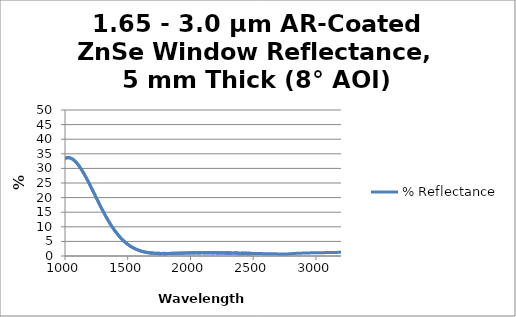
| Category | % Reflectance |
|---|---|
| 200.0 | 3.666 |
| 201.0 | 5.082 |
| 202.0 | 7.073 |
| 203.0 | 9.53 |
| 204.0 | 12.258 |
| 205.0 | 15.007 |
| 206.0 | 17.717 |
| 207.0 | 20.237 |
| 208.0 | 22.5 |
| 209.0 | 24.426 |
| 210.0 | 25.97 |
| 211.0 | 27.179 |
| 212.0 | 28.001 |
| 213.0 | 28.426 |
| 214.0 | 28.436 |
| 215.0 | 28.164 |
| 216.0 | 27.626 |
| 217.0 | 26.695 |
| 218.0 | 25.353 |
| 219.0 | 23.731 |
| 220.0 | 21.91 |
| 221.0 | 19.888 |
| 222.0 | 17.68 |
| 223.0 | 15.425 |
| 224.0 | 13.133 |
| 225.0 | 10.946 |
| 226.0 | 8.916 |
| 227.0 | 7.064 |
| 228.0 | 5.542 |
| 229.0 | 4.414 |
| 230.0 | 3.74 |
| 231.0 | 3.552 |
| 232.0 | 3.887 |
| 233.0 | 4.678 |
| 234.0 | 5.891 |
| 235.0 | 7.478 |
| 236.0 | 9.379 |
| 237.0 | 11.511 |
| 238.0 | 13.826 |
| 239.0 | 16.229 |
| 240.0 | 18.621 |
| 241.0 | 20.924 |
| 242.0 | 23.081 |
| 243.0 | 25.056 |
| 244.0 | 26.84 |
| 245.0 | 28.445 |
| 246.0 | 29.845 |
| 247.0 | 31.042 |
| 248.0 | 32.017 |
| 249.0 | 32.776 |
| 250.0 | 33.296 |
| 251.0 | 33.551 |
| 252.0 | 33.575 |
| 253.0 | 33.398 |
| 254.0 | 33.012 |
| 255.0 | 32.386 |
| 256.0 | 31.574 |
| 257.0 | 30.581 |
| 258.0 | 29.33 |
| 259.0 | 27.92 |
| 260.0 | 26.351 |
| 261.0 | 24.632 |
| 262.0 | 22.848 |
| 263.0 | 20.999 |
| 264.0 | 19.094 |
| 265.0 | 17.198 |
| 266.0 | 15.297 |
| 267.0 | 13.388 |
| 268.0 | 11.549 |
| 269.0 | 9.837 |
| 270.0 | 8.294 |
| 271.0 | 6.973 |
| 272.0 | 5.88 |
| 273.0 | 4.996 |
| 274.0 | 4.354 |
| 275.0 | 3.959 |
| 276.0 | 3.806 |
| 277.0 | 3.928 |
| 278.0 | 4.288 |
| 279.0 | 4.836 |
| 280.0 | 5.585 |
| 281.0 | 6.544 |
| 282.0 | 7.652 |
| 283.0 | 8.867 |
| 284.0 | 10.141 |
| 285.0 | 11.494 |
| 286.0 | 12.906 |
| 287.0 | 14.3 |
| 288.0 | 15.71 |
| 289.0 | 17.126 |
| 290.0 | 18.454 |
| 291.0 | 19.744 |
| 292.0 | 20.956 |
| 293.0 | 21.994 |
| 294.0 | 22.928 |
| 295.0 | 23.801 |
| 296.0 | 24.588 |
| 297.0 | 25.205 |
| 298.0 | 25.71 |
| 299.0 | 26.096 |
| 300.0 | 26.326 |
| 301.0 | 26.457 |
| 302.0 | 26.517 |
| 303.0 | 26.393 |
| 304.0 | 26.192 |
| 305.0 | 25.94 |
| 306.0 | 25.543 |
| 307.0 | 25.044 |
| 308.0 | 24.434 |
| 309.0 | 23.781 |
| 310.0 | 23.091 |
| 311.0 | 22.331 |
| 312.0 | 21.509 |
| 313.0 | 20.663 |
| 314.0 | 19.825 |
| 315.0 | 19.042 |
| 316.0 | 18.15 |
| 317.0 | 17.245 |
| 318.0 | 16.491 |
| 319.0 | 15.739 |
| 320.0 | 14.929 |
| 321.0 | 14.185 |
| 322.0 | 13.443 |
| 323.0 | 12.808 |
| 324.0 | 12.196 |
| 325.0 | 11.619 |
| 326.0 | 11.099 |
| 327.0 | 10.601 |
| 328.0 | 10.138 |
| 329.0 | 9.706 |
| 330.0 | 9.29 |
| 331.0 | 8.936 |
| 332.0 | 8.601 |
| 333.0 | 8.249 |
| 334.0 | 7.949 |
| 335.0 | 7.656 |
| 336.0 | 7.331 |
| 337.0 | 7.024 |
| 338.0 | 6.688 |
| 339.0 | 6.376 |
| 340.0 | 6.057 |
| 341.0 | 5.703 |
| 342.0 | 5.356 |
| 343.0 | 4.998 |
| 344.0 | 4.664 |
| 345.0 | 4.349 |
| 346.0 | 4.021 |
| 347.0 | 3.683 |
| 348.0 | 3.377 |
| 349.0 | 3.122 |
| 350.0 | 2.888 |
| 351.0 | 2.7 |
| 352.0 | 2.589 |
| 353.0 | 2.529 |
| 354.0 | 2.52 |
| 355.0 | 2.613 |
| 356.0 | 2.776 |
| 357.0 | 3.011 |
| 358.0 | 3.351 |
| 359.0 | 3.795 |
| 360.0 | 4.333 |
| 361.0 | 4.978 |
| 362.0 | 5.707 |
| 363.0 | 6.506 |
| 364.0 | 7.385 |
| 365.0 | 8.337 |
| 366.0 | 9.362 |
| 367.0 | 10.458 |
| 368.0 | 11.635 |
| 369.0 | 12.869 |
| 370.0 | 14.145 |
| 371.0 | 15.454 |
| 372.0 | 16.749 |
| 373.0 | 18.017 |
| 374.0 | 19.275 |
| 375.0 | 20.562 |
| 376.0 | 21.82 |
| 377.0 | 23.061 |
| 378.0 | 24.7 |
| 379.0 | 26.107 |
| 380.0 | 27.349 |
| 381.0 | 28.548 |
| 382.0 | 29.668 |
| 383.0 | 30.772 |
| 384.0 | 31.813 |
| 385.0 | 32.813 |
| 386.0 | 33.759 |
| 387.0 | 34.687 |
| 388.0 | 35.555 |
| 389.0 | 36.393 |
| 390.0 | 37.192 |
| 391.0 | 37.956 |
| 392.0 | 38.614 |
| 393.0 | 39.215 |
| 394.0 | 39.769 |
| 395.0 | 40.284 |
| 396.0 | 40.764 |
| 397.0 | 41.2 |
| 398.0 | 41.608 |
| 399.0 | 41.947 |
| 400.0 | 42.245 |
| 401.0 | 42.464 |
| 402.0 | 42.649 |
| 403.0 | 42.78 |
| 404.0 | 42.878 |
| 405.0 | 42.956 |
| 406.0 | 42.94 |
| 407.0 | 42.878 |
| 408.0 | 42.765 |
| 409.0 | 42.662 |
| 410.0 | 42.465 |
| 411.0 | 42.237 |
| 412.0 | 41.969 |
| 413.0 | 41.659 |
| 414.0 | 41.282 |
| 415.0 | 40.887 |
| 416.0 | 40.444 |
| 417.0 | 39.965 |
| 418.0 | 39.449 |
| 419.0 | 38.85 |
| 420.0 | 38.249 |
| 421.0 | 37.578 |
| 422.0 | 36.902 |
| 423.0 | 36.187 |
| 424.0 | 35.476 |
| 425.0 | 34.699 |
| 426.0 | 33.874 |
| 427.0 | 33.04 |
| 428.0 | 32.146 |
| 429.0 | 31.23 |
| 430.0 | 30.333 |
| 431.0 | 29.372 |
| 432.0 | 28.424 |
| 433.0 | 27.475 |
| 434.0 | 26.524 |
| 435.0 | 25.558 |
| 436.0 | 24.574 |
| 437.0 | 23.59 |
| 438.0 | 22.564 |
| 439.0 | 21.562 |
| 440.0 | 20.578 |
| 441.0 | 19.597 |
| 442.0 | 18.652 |
| 443.0 | 17.733 |
| 444.0 | 16.851 |
| 445.0 | 15.974 |
| 446.0 | 15.121 |
| 447.0 | 14.271 |
| 448.0 | 13.471 |
| 449.0 | 12.703 |
| 450.0 | 11.994 |
| 451.0 | 11.323 |
| 452.0 | 10.728 |
| 453.0 | 10.188 |
| 454.0 | 9.698 |
| 455.0 | 9.263 |
| 456.0 | 8.879 |
| 457.0 | 8.541 |
| 458.0 | 8.286 |
| 459.0 | 8.08 |
| 460.0 | 7.939 |
| 461.0 | 7.862 |
| 462.0 | 7.861 |
| 463.0 | 7.926 |
| 464.0 | 8.04 |
| 465.0 | 8.216 |
| 466.0 | 8.446 |
| 467.0 | 8.729 |
| 468.0 | 9.047 |
| 469.0 | 9.427 |
| 470.0 | 9.843 |
| 471.0 | 10.286 |
| 472.0 | 10.747 |
| 473.0 | 11.234 |
| 474.0 | 11.743 |
| 475.0 | 12.271 |
| 476.0 | 12.832 |
| 477.0 | 13.401 |
| 478.0 | 13.975 |
| 479.0 | 14.561 |
| 480.0 | 15.146 |
| 481.0 | 15.712 |
| 482.0 | 16.281 |
| 483.0 | 16.837 |
| 484.0 | 17.37 |
| 485.0 | 17.901 |
| 486.0 | 18.411 |
| 487.0 | 18.916 |
| 488.0 | 19.365 |
| 489.0 | 19.818 |
| 490.0 | 20.218 |
| 491.0 | 20.588 |
| 492.0 | 20.908 |
| 493.0 | 21.223 |
| 494.0 | 21.482 |
| 495.0 | 21.709 |
| 496.0 | 21.906 |
| 497.0 | 22.073 |
| 498.0 | 22.194 |
| 499.0 | 22.257 |
| 500.0 | 22.321 |
| 501.0 | 22.317 |
| 502.0 | 22.286 |
| 503.0 | 22.237 |
| 504.0 | 22.135 |
| 505.0 | 22.01 |
| 506.0 | 21.854 |
| 507.0 | 21.634 |
| 508.0 | 21.385 |
| 509.0 | 21.113 |
| 510.0 | 20.813 |
| 511.0 | 20.464 |
| 512.0 | 20.107 |
| 513.0 | 19.727 |
| 514.0 | 19.333 |
| 515.0 | 18.904 |
| 516.0 | 18.437 |
| 517.0 | 17.946 |
| 518.0 | 17.433 |
| 519.0 | 16.885 |
| 520.0 | 16.344 |
| 521.0 | 15.773 |
| 522.0 | 15.197 |
| 523.0 | 14.616 |
| 524.0 | 14.021 |
| 525.0 | 13.42 |
| 526.0 | 12.8 |
| 527.0 | 12.157 |
| 528.0 | 11.514 |
| 529.0 | 10.873 |
| 530.0 | 10.231 |
| 531.0 | 9.6 |
| 532.0 | 8.981 |
| 533.0 | 8.374 |
| 534.0 | 7.78 |
| 535.0 | 7.191 |
| 536.0 | 6.603 |
| 537.0 | 6.029 |
| 538.0 | 5.477 |
| 539.0 | 4.944 |
| 540.0 | 4.434 |
| 541.0 | 3.948 |
| 542.0 | 3.502 |
| 543.0 | 3.085 |
| 544.0 | 2.696 |
| 545.0 | 2.338 |
| 546.0 | 2.01 |
| 547.0 | 1.708 |
| 548.0 | 1.445 |
| 549.0 | 1.223 |
| 550.0 | 1.035 |
| 551.0 | 0.89 |
| 552.0 | 0.783 |
| 553.0 | 0.719 |
| 554.0 | 0.694 |
| 555.0 | 0.706 |
| 556.0 | 0.758 |
| 557.0 | 0.844 |
| 558.0 | 0.98 |
| 559.0 | 1.154 |
| 560.0 | 1.357 |
| 561.0 | 1.608 |
| 562.0 | 1.915 |
| 563.0 | 2.227 |
| 564.0 | 2.563 |
| 565.0 | 2.935 |
| 566.0 | 3.345 |
| 567.0 | 3.785 |
| 568.0 | 4.255 |
| 569.0 | 4.756 |
| 570.0 | 5.277 |
| 571.0 | 5.821 |
| 572.0 | 6.375 |
| 573.0 | 6.943 |
| 574.0 | 7.526 |
| 575.0 | 8.13 |
| 576.0 | 8.751 |
| 577.0 | 9.397 |
| 578.0 | 10.049 |
| 579.0 | 10.717 |
| 580.0 | 11.389 |
| 581.0 | 12.063 |
| 582.0 | 12.734 |
| 583.0 | 13.399 |
| 584.0 | 14.066 |
| 585.0 | 14.744 |
| 586.0 | 15.42 |
| 587.0 | 16.119 |
| 588.0 | 16.815 |
| 589.0 | 17.495 |
| 590.0 | 18.17 |
| 591.0 | 18.846 |
| 592.0 | 19.502 |
| 593.0 | 20.143 |
| 594.0 | 20.776 |
| 595.0 | 21.419 |
| 596.0 | 22.065 |
| 597.0 | 22.686 |
| 598.0 | 23.311 |
| 599.0 | 23.935 |
| 600.0 | 24.542 |
| 601.0 | 25.138 |
| 602.0 | 25.702 |
| 603.0 | 26.263 |
| 604.0 | 26.801 |
| 605.0 | 27.341 |
| 606.0 | 27.885 |
| 607.0 | 28.414 |
| 608.0 | 28.923 |
| 609.0 | 29.43 |
| 610.0 | 29.928 |
| 611.0 | 30.407 |
| 612.0 | 30.868 |
| 613.0 | 31.309 |
| 614.0 | 31.749 |
| 615.0 | 32.161 |
| 616.0 | 32.571 |
| 617.0 | 32.989 |
| 618.0 | 33.385 |
| 619.0 | 33.781 |
| 620.0 | 34.157 |
| 621.0 | 34.505 |
| 622.0 | 34.862 |
| 623.0 | 35.189 |
| 624.0 | 35.492 |
| 625.0 | 35.819 |
| 626.0 | 36.114 |
| 627.0 | 36.412 |
| 628.0 | 36.699 |
| 629.0 | 36.973 |
| 630.0 | 37.24 |
| 631.0 | 37.485 |
| 632.0 | 37.733 |
| 633.0 | 37.954 |
| 634.0 | 38.173 |
| 635.0 | 38.387 |
| 636.0 | 38.581 |
| 637.0 | 38.778 |
| 638.0 | 38.965 |
| 639.0 | 39.141 |
| 640.0 | 39.292 |
| 641.0 | 39.45 |
| 642.0 | 39.599 |
| 643.0 | 39.725 |
| 644.0 | 39.842 |
| 645.0 | 39.96 |
| 646.0 | 40.066 |
| 647.0 | 40.169 |
| 648.0 | 40.275 |
| 649.0 | 40.368 |
| 650.0 | 40.436 |
| 651.0 | 40.501 |
| 652.0 | 40.582 |
| 653.0 | 40.639 |
| 654.0 | 40.67 |
| 655.0 | 40.719 |
| 656.0 | 40.754 |
| 657.0 | 40.752 |
| 658.0 | 40.765 |
| 659.0 | 40.783 |
| 660.0 | 40.789 |
| 661.0 | 40.798 |
| 662.0 | 40.788 |
| 663.0 | 40.756 |
| 664.0 | 40.724 |
| 665.0 | 40.697 |
| 666.0 | 40.663 |
| 667.0 | 40.605 |
| 668.0 | 40.546 |
| 669.0 | 40.491 |
| 670.0 | 40.431 |
| 671.0 | 40.365 |
| 672.0 | 40.296 |
| 673.0 | 40.221 |
| 674.0 | 40.125 |
| 675.0 | 40.03 |
| 676.0 | 39.935 |
| 677.0 | 39.825 |
| 678.0 | 39.712 |
| 679.0 | 39.605 |
| 680.0 | 39.468 |
| 681.0 | 39.328 |
| 682.0 | 39.198 |
| 683.0 | 39.064 |
| 684.0 | 38.927 |
| 685.0 | 38.777 |
| 686.0 | 38.611 |
| 687.0 | 38.458 |
| 688.0 | 38.305 |
| 689.0 | 38.123 |
| 690.0 | 37.94 |
| 691.0 | 37.76 |
| 692.0 | 37.592 |
| 693.0 | 37.428 |
| 694.0 | 37.228 |
| 695.0 | 37.034 |
| 696.0 | 36.84 |
| 697.0 | 36.624 |
| 698.0 | 36.414 |
| 699.0 | 36.198 |
| 700.0 | 35.97 |
| 701.0 | 35.754 |
| 702.0 | 35.538 |
| 703.0 | 35.301 |
| 704.0 | 35.078 |
| 705.0 | 34.867 |
| 706.0 | 34.631 |
| 707.0 | 34.379 |
| 708.0 | 34.136 |
| 709.0 | 33.872 |
| 710.0 | 33.616 |
| 711.0 | 33.37 |
| 712.0 | 33.113 |
| 713.0 | 32.857 |
| 714.0 | 32.608 |
| 715.0 | 32.349 |
| 716.0 | 32.088 |
| 717.0 | 31.817 |
| 718.0 | 31.54 |
| 719.0 | 31.257 |
| 720.0 | 30.984 |
| 721.0 | 30.712 |
| 722.0 | 30.441 |
| 723.0 | 30.174 |
| 724.0 | 29.903 |
| 725.0 | 29.618 |
| 726.0 | 29.336 |
| 727.0 | 29.051 |
| 728.0 | 28.762 |
| 729.0 | 28.473 |
| 730.0 | 28.181 |
| 731.0 | 27.904 |
| 732.0 | 27.611 |
| 733.0 | 27.332 |
| 734.0 | 27.065 |
| 735.0 | 26.786 |
| 736.0 | 26.491 |
| 737.0 | 26.211 |
| 738.0 | 25.905 |
| 739.0 | 25.625 |
| 740.0 | 25.332 |
| 741.0 | 25.06 |
| 742.0 | 24.787 |
| 743.0 | 24.504 |
| 744.0 | 24.235 |
| 745.0 | 23.957 |
| 746.0 | 23.682 |
| 747.0 | 23.398 |
| 748.0 | 23.128 |
| 749.0 | 22.849 |
| 750.0 | 22.58 |
| 751.0 | 22.304 |
| 752.0 | 22.043 |
| 753.0 | 21.79 |
| 754.0 | 21.543 |
| 755.0 | 21.273 |
| 756.0 | 21.021 |
| 757.0 | 20.772 |
| 758.0 | 20.527 |
| 759.0 | 20.284 |
| 760.0 | 20.033 |
| 761.0 | 19.792 |
| 762.0 | 19.574 |
| 763.0 | 19.341 |
| 764.0 | 19.129 |
| 765.0 | 18.901 |
| 766.0 | 18.678 |
| 767.0 | 18.449 |
| 768.0 | 18.241 |
| 769.0 | 18.033 |
| 770.0 | 17.819 |
| 771.0 | 17.632 |
| 772.0 | 17.438 |
| 773.0 | 17.259 |
| 774.0 | 17.089 |
| 775.0 | 16.901 |
| 776.0 | 16.727 |
| 777.0 | 16.56 |
| 778.0 | 16.395 |
| 779.0 | 16.235 |
| 780.0 | 16.076 |
| 781.0 | 15.918 |
| 782.0 | 15.785 |
| 783.0 | 15.649 |
| 784.0 | 15.52 |
| 785.0 | 15.391 |
| 786.0 | 15.275 |
| 787.0 | 15.162 |
| 788.0 | 15.037 |
| 789.0 | 14.927 |
| 790.0 | 14.826 |
| 791.0 | 14.746 |
| 792.0 | 14.66 |
| 793.0 | 14.572 |
| 794.0 | 14.489 |
| 795.0 | 14.417 |
| 796.0 | 14.352 |
| 797.0 | 14.278 |
| 798.0 | 14.235 |
| 799.0 | 14.184 |
| 800.0 | 14.144 |
| 801.0 | 14.095 |
| 802.0 | 14.063 |
| 803.0 | 14.029 |
| 804.0 | 14.006 |
| 805.0 | 13.989 |
| 806.0 | 13.982 |
| 807.0 | 13.97 |
| 808.0 | 13.963 |
| 809.0 | 13.949 |
| 810.0 | 13.969 |
| 811.0 | 13.985 |
| 812.0 | 13.978 |
| 813.0 | 14.004 |
| 814.0 | 14.041 |
| 815.0 | 14.062 |
| 816.0 | 14.104 |
| 817.0 | 14.142 |
| 818.0 | 14.174 |
| 819.0 | 14.225 |
| 820.0 | 14.279 |
| 821.0 | 14.33 |
| 822.0 | 14.405 |
| 823.0 | 14.456 |
| 824.0 | 14.528 |
| 825.0 | 14.601 |
| 826.0 | 14.676 |
| 827.0 | 14.761 |
| 828.0 | 14.845 |
| 829.0 | 14.936 |
| 830.0 | 15.013 |
| 831.0 | 15.118 |
| 832.0 | 15.209 |
| 833.0 | 15.309 |
| 834.0 | 15.41 |
| 835.0 | 15.507 |
| 836.0 | 15.609 |
| 837.0 | 15.723 |
| 838.0 | 15.821 |
| 839.0 | 15.964 |
| 840.0 | 16.086 |
| 841.0 | 16.192 |
| 842.0 | 16.311 |
| 843.0 | 16.448 |
| 844.0 | 16.575 |
| 845.0 | 16.697 |
| 846.0 | 16.825 |
| 847.0 | 16.962 |
| 848.0 | 17.099 |
| 849.0 | 17.254 |
| 850.0 | 17.379 |
| 851.0 | 17.524 |
| 852.0 | 17.669 |
| 853.0 | 17.803 |
| 854.0 | 17.96 |
| 855.0 | 18.083 |
| 856.0 | 18.227 |
| 857.0 | 18.384 |
| 858.0 | 18.557 |
| 859.0 | 18.701 |
| 860.0 | 18.862 |
| 861.0 | 18.843 |
| 862.0 | 19.143 |
| 863.0 | 19.312 |
| 864.0 | 19.48 |
| 865.0 | 19.856 |
| 866.0 | 19.907 |
| 867.0 | 20.066 |
| 868.0 | 20.012 |
| 869.0 | 20.087 |
| 870.0 | 20.467 |
| 871.0 | 20.773 |
| 872.0 | 20.829 |
| 873.0 | 20.931 |
| 874.0 | 21.075 |
| 875.0 | 21.315 |
| 876.0 | 21.413 |
| 877.0 | 21.7 |
| 878.0 | 21.84 |
| 879.0 | 21.999 |
| 880.0 | 22.022 |
| 881.0 | 22.106 |
| 882.0 | 22.272 |
| 883.0 | 22.481 |
| 884.0 | 22.803 |
| 885.0 | 22.969 |
| 886.0 | 23.087 |
| 887.0 | 23.136 |
| 888.0 | 23.238 |
| 889.0 | 23.337 |
| 890.0 | 23.452 |
| 891.0 | 23.702 |
| 892.0 | 23.906 |
| 893.0 | 23.855 |
| 894.0 | 24.016 |
| 895.0 | 24.284 |
| 896.0 | 24.459 |
| 897.0 | 24.485 |
| 898.0 | 24.738 |
| 899.0 | 24.941 |
| 900.0 | 25.011 |
| 901.0 | 25.104 |
| 902.0 | 25.231 |
| 903.0 | 25.43 |
| 904.0 | 25.593 |
| 905.0 | 25.733 |
| 906.0 | 25.885 |
| 907.0 | 25.969 |
| 908.0 | 26.172 |
| 909.0 | 26.269 |
| 910.0 | 26.324 |
| 911.0 | 26.49 |
| 912.0 | 26.655 |
| 913.0 | 26.766 |
| 914.0 | 26.897 |
| 915.0 | 26.956 |
| 916.0 | 27.068 |
| 917.0 | 27.222 |
| 918.0 | 27.402 |
| 919.0 | 27.486 |
| 920.0 | 27.576 |
| 921.0 | 27.777 |
| 922.0 | 27.815 |
| 923.0 | 27.993 |
| 924.0 | 28.1 |
| 925.0 | 28.196 |
| 926.0 | 28.323 |
| 927.0 | 28.427 |
| 928.0 | 28.545 |
| 929.0 | 28.636 |
| 930.0 | 28.787 |
| 931.0 | 28.856 |
| 932.0 | 28.968 |
| 933.0 | 29.122 |
| 934.0 | 29.274 |
| 935.0 | 29.256 |
| 936.0 | 29.395 |
| 937.0 | 29.463 |
| 938.0 | 29.62 |
| 939.0 | 29.71 |
| 940.0 | 29.781 |
| 941.0 | 29.851 |
| 942.0 | 30.004 |
| 943.0 | 30.064 |
| 944.0 | 30.123 |
| 945.0 | 30.204 |
| 946.0 | 30.289 |
| 947.0 | 30.372 |
| 948.0 | 30.472 |
| 949.0 | 30.569 |
| 950.0 | 30.682 |
| 951.0 | 30.753 |
| 952.0 | 30.808 |
| 953.0 | 30.943 |
| 954.0 | 31.002 |
| 955.0 | 31.039 |
| 956.0 | 31.141 |
| 957.0 | 31.224 |
| 958.0 | 31.317 |
| 959.0 | 31.356 |
| 960.0 | 31.444 |
| 961.0 | 31.523 |
| 962.0 | 31.602 |
| 963.0 | 31.626 |
| 964.0 | 31.672 |
| 965.0 | 31.714 |
| 966.0 | 31.795 |
| 967.0 | 31.88 |
| 968.0 | 31.948 |
| 969.0 | 32.015 |
| 970.0 | 32.058 |
| 971.0 | 32.073 |
| 972.0 | 32.138 |
| 973.0 | 32.182 |
| 974.0 | 32.23 |
| 975.0 | 32.241 |
| 976.0 | 32.305 |
| 977.0 | 32.334 |
| 978.0 | 32.387 |
| 979.0 | 32.43 |
| 980.0 | 32.507 |
| 981.0 | 32.539 |
| 982.0 | 32.575 |
| 983.0 | 32.654 |
| 984.0 | 32.665 |
| 985.0 | 32.76 |
| 986.0 | 32.787 |
| 987.0 | 32.843 |
| 988.0 | 32.924 |
| 989.0 | 32.926 |
| 990.0 | 32.959 |
| 991.0 | 33.032 |
| 992.0 | 33.061 |
| 993.0 | 33.116 |
| 994.0 | 33.127 |
| 995.0 | 33.196 |
| 996.0 | 33.238 |
| 997.0 | 33.252 |
| 998.0 | 33.275 |
| 999.0 | 33.302 |
| 1000.0 | 33.349 |
| 1001.0 | 33.37 |
| 1002.0 | 33.404 |
| 1003.0 | 33.423 |
| 1004.0 | 33.472 |
| 1005.0 | 33.454 |
| 1006.0 | 33.501 |
| 1007.0 | 33.51 |
| 1008.0 | 33.545 |
| 1009.0 | 33.575 |
| 1010.0 | 33.584 |
| 1011.0 | 33.588 |
| 1012.0 | 33.634 |
| 1013.0 | 33.628 |
| 1014.0 | 33.633 |
| 1015.0 | 33.634 |
| 1016.0 | 33.654 |
| 1017.0 | 33.655 |
| 1018.0 | 33.678 |
| 1019.0 | 33.693 |
| 1020.0 | 33.684 |
| 1021.0 | 33.675 |
| 1022.0 | 33.686 |
| 1023.0 | 33.695 |
| 1024.0 | 33.708 |
| 1025.0 | 33.675 |
| 1026.0 | 33.684 |
| 1027.0 | 33.72 |
| 1028.0 | 33.723 |
| 1029.0 | 33.712 |
| 1030.0 | 33.701 |
| 1031.0 | 33.665 |
| 1032.0 | 33.644 |
| 1033.0 | 33.633 |
| 1034.0 | 33.629 |
| 1035.0 | 33.647 |
| 1036.0 | 33.607 |
| 1037.0 | 33.597 |
| 1038.0 | 33.609 |
| 1039.0 | 33.579 |
| 1040.0 | 33.558 |
| 1041.0 | 33.551 |
| 1042.0 | 33.573 |
| 1043.0 | 33.535 |
| 1044.0 | 33.512 |
| 1045.0 | 33.509 |
| 1046.0 | 33.508 |
| 1047.0 | 33.478 |
| 1048.0 | 33.47 |
| 1049.0 | 33.411 |
| 1050.0 | 33.407 |
| 1051.0 | 33.383 |
| 1052.0 | 33.398 |
| 1053.0 | 33.393 |
| 1054.0 | 33.318 |
| 1055.0 | 33.293 |
| 1056.0 | 33.274 |
| 1057.0 | 33.234 |
| 1058.0 | 33.225 |
| 1059.0 | 33.195 |
| 1060.0 | 33.147 |
| 1061.0 | 33.133 |
| 1062.0 | 33.121 |
| 1063.0 | 33.091 |
| 1064.0 | 33.045 |
| 1065.0 | 33.058 |
| 1066.0 | 33.025 |
| 1067.0 | 32.976 |
| 1068.0 | 32.931 |
| 1069.0 | 32.902 |
| 1070.0 | 32.855 |
| 1071.0 | 32.819 |
| 1072.0 | 32.792 |
| 1073.0 | 32.766 |
| 1074.0 | 32.705 |
| 1075.0 | 32.679 |
| 1076.0 | 32.636 |
| 1077.0 | 32.584 |
| 1078.0 | 32.552 |
| 1079.0 | 32.501 |
| 1080.0 | 32.459 |
| 1081.0 | 32.42 |
| 1082.0 | 32.401 |
| 1083.0 | 32.342 |
| 1084.0 | 32.289 |
| 1085.0 | 32.248 |
| 1086.0 | 32.23 |
| 1087.0 | 32.159 |
| 1088.0 | 32.108 |
| 1089.0 | 32.068 |
| 1090.0 | 32.019 |
| 1091.0 | 31.962 |
| 1092.0 | 31.908 |
| 1093.0 | 31.857 |
| 1094.0 | 31.801 |
| 1095.0 | 31.755 |
| 1096.0 | 31.721 |
| 1097.0 | 31.665 |
| 1098.0 | 31.615 |
| 1099.0 | 31.569 |
| 1100.0 | 31.533 |
| 1101.0 | 31.477 |
| 1102.0 | 31.409 |
| 1103.0 | 31.352 |
| 1104.0 | 31.293 |
| 1105.0 | 31.257 |
| 1106.0 | 31.212 |
| 1107.0 | 31.141 |
| 1108.0 | 31.075 |
| 1109.0 | 31.032 |
| 1110.0 | 30.976 |
| 1111.0 | 30.914 |
| 1112.0 | 30.852 |
| 1113.0 | 30.785 |
| 1114.0 | 30.722 |
| 1115.0 | 30.638 |
| 1116.0 | 30.604 |
| 1117.0 | 30.54 |
| 1118.0 | 30.484 |
| 1119.0 | 30.408 |
| 1120.0 | 30.353 |
| 1121.0 | 30.294 |
| 1122.0 | 30.215 |
| 1123.0 | 30.145 |
| 1124.0 | 30.093 |
| 1125.0 | 30.017 |
| 1126.0 | 29.927 |
| 1127.0 | 29.846 |
| 1128.0 | 29.786 |
| 1129.0 | 29.74 |
| 1130.0 | 29.659 |
| 1131.0 | 29.594 |
| 1132.0 | 29.548 |
| 1133.0 | 29.487 |
| 1134.0 | 29.437 |
| 1135.0 | 29.369 |
| 1136.0 | 29.274 |
| 1137.0 | 29.193 |
| 1138.0 | 29.142 |
| 1139.0 | 29.067 |
| 1140.0 | 28.998 |
| 1141.0 | 28.927 |
| 1142.0 | 28.862 |
| 1143.0 | 28.778 |
| 1144.0 | 28.694 |
| 1145.0 | 28.626 |
| 1146.0 | 28.554 |
| 1147.0 | 28.487 |
| 1148.0 | 28.417 |
| 1149.0 | 28.348 |
| 1150.0 | 28.278 |
| 1151.0 | 28.198 |
| 1152.0 | 28.13 |
| 1153.0 | 28.054 |
| 1154.0 | 27.969 |
| 1155.0 | 27.884 |
| 1156.0 | 27.796 |
| 1157.0 | 27.721 |
| 1158.0 | 27.658 |
| 1159.0 | 27.587 |
| 1160.0 | 27.501 |
| 1161.0 | 27.415 |
| 1162.0 | 27.333 |
| 1163.0 | 27.263 |
| 1164.0 | 27.18 |
| 1165.0 | 27.091 |
| 1166.0 | 27.014 |
| 1167.0 | 26.937 |
| 1168.0 | 26.873 |
| 1169.0 | 26.786 |
| 1170.0 | 26.696 |
| 1171.0 | 26.602 |
| 1172.0 | 26.522 |
| 1173.0 | 26.467 |
| 1174.0 | 26.392 |
| 1175.0 | 26.308 |
| 1176.0 | 26.244 |
| 1177.0 | 26.155 |
| 1178.0 | 26.064 |
| 1179.0 | 25.976 |
| 1180.0 | 25.912 |
| 1181.0 | 25.838 |
| 1182.0 | 25.757 |
| 1183.0 | 25.675 |
| 1184.0 | 25.588 |
| 1185.0 | 25.488 |
| 1186.0 | 25.399 |
| 1187.0 | 25.331 |
| 1188.0 | 25.274 |
| 1189.0 | 25.189 |
| 1190.0 | 25.081 |
| 1191.0 | 24.993 |
| 1192.0 | 24.917 |
| 1193.0 | 24.825 |
| 1194.0 | 24.729 |
| 1195.0 | 24.647 |
| 1196.0 | 24.575 |
| 1197.0 | 24.481 |
| 1198.0 | 24.385 |
| 1199.0 | 24.295 |
| 1200.0 | 24.203 |
| 1201.0 | 24.12 |
| 1202.0 | 24.037 |
| 1203.0 | 23.958 |
| 1204.0 | 23.866 |
| 1205.0 | 23.781 |
| 1206.0 | 23.716 |
| 1207.0 | 23.615 |
| 1208.0 | 23.506 |
| 1209.0 | 23.412 |
| 1210.0 | 23.322 |
| 1211.0 | 23.243 |
| 1212.0 | 23.173 |
| 1213.0 | 23.108 |
| 1214.0 | 23.016 |
| 1215.0 | 22.915 |
| 1216.0 | 22.844 |
| 1217.0 | 22.765 |
| 1218.0 | 22.683 |
| 1219.0 | 22.597 |
| 1220.0 | 22.514 |
| 1221.0 | 22.425 |
| 1222.0 | 22.336 |
| 1223.0 | 22.255 |
| 1224.0 | 22.172 |
| 1225.0 | 22.079 |
| 1226.0 | 21.981 |
| 1227.0 | 21.903 |
| 1228.0 | 21.824 |
| 1229.0 | 21.726 |
| 1230.0 | 21.627 |
| 1231.0 | 21.544 |
| 1232.0 | 21.455 |
| 1233.0 | 21.373 |
| 1234.0 | 21.29 |
| 1235.0 | 21.188 |
| 1236.0 | 21.091 |
| 1237.0 | 21.008 |
| 1238.0 | 20.924 |
| 1239.0 | 20.829 |
| 1240.0 | 20.736 |
| 1241.0 | 20.639 |
| 1242.0 | 20.559 |
| 1243.0 | 20.471 |
| 1244.0 | 20.366 |
| 1245.0 | 20.277 |
| 1246.0 | 20.184 |
| 1247.0 | 20.096 |
| 1248.0 | 20.025 |
| 1249.0 | 19.939 |
| 1250.0 | 19.858 |
| 1251.0 | 19.775 |
| 1252.0 | 19.69 |
| 1253.0 | 19.619 |
| 1254.0 | 19.542 |
| 1255.0 | 19.448 |
| 1256.0 | 19.352 |
| 1257.0 | 19.272 |
| 1258.0 | 19.177 |
| 1259.0 | 19.078 |
| 1260.0 | 18.992 |
| 1261.0 | 18.92 |
| 1262.0 | 18.846 |
| 1263.0 | 18.766 |
| 1264.0 | 18.677 |
| 1265.0 | 18.595 |
| 1266.0 | 18.514 |
| 1267.0 | 18.423 |
| 1268.0 | 18.326 |
| 1269.0 | 18.23 |
| 1270.0 | 18.136 |
| 1271.0 | 18.034 |
| 1272.0 | 17.964 |
| 1273.0 | 17.879 |
| 1274.0 | 17.791 |
| 1275.0 | 17.704 |
| 1276.0 | 17.632 |
| 1277.0 | 17.544 |
| 1278.0 | 17.449 |
| 1279.0 | 17.339 |
| 1280.0 | 17.246 |
| 1281.0 | 17.144 |
| 1282.0 | 17.075 |
| 1283.0 | 16.995 |
| 1284.0 | 16.918 |
| 1285.0 | 16.832 |
| 1286.0 | 16.758 |
| 1287.0 | 16.682 |
| 1288.0 | 16.587 |
| 1289.0 | 16.514 |
| 1290.0 | 16.443 |
| 1291.0 | 16.341 |
| 1292.0 | 16.255 |
| 1293.0 | 16.164 |
| 1294.0 | 16.084 |
| 1295.0 | 16.017 |
| 1296.0 | 15.926 |
| 1297.0 | 15.851 |
| 1298.0 | 15.767 |
| 1299.0 | 15.695 |
| 1300.0 | 15.611 |
| 1301.0 | 15.547 |
| 1302.0 | 15.461 |
| 1303.0 | 15.377 |
| 1304.0 | 15.298 |
| 1305.0 | 15.202 |
| 1306.0 | 15.131 |
| 1307.0 | 15.066 |
| 1308.0 | 14.99 |
| 1309.0 | 14.925 |
| 1310.0 | 14.849 |
| 1311.0 | 14.74 |
| 1312.0 | 14.665 |
| 1313.0 | 14.584 |
| 1314.0 | 14.503 |
| 1315.0 | 14.426 |
| 1316.0 | 14.331 |
| 1317.0 | 14.244 |
| 1318.0 | 14.155 |
| 1319.0 | 14.084 |
| 1320.0 | 14.012 |
| 1321.0 | 13.934 |
| 1322.0 | 13.841 |
| 1323.0 | 13.754 |
| 1324.0 | 13.691 |
| 1325.0 | 13.603 |
| 1326.0 | 13.529 |
| 1327.0 | 13.464 |
| 1328.0 | 13.393 |
| 1329.0 | 13.322 |
| 1330.0 | 13.225 |
| 1331.0 | 13.148 |
| 1332.0 | 13.081 |
| 1333.0 | 13.001 |
| 1334.0 | 12.93 |
| 1335.0 | 12.861 |
| 1336.0 | 12.791 |
| 1337.0 | 12.72 |
| 1338.0 | 12.659 |
| 1339.0 | 12.571 |
| 1340.0 | 12.512 |
| 1341.0 | 12.422 |
| 1342.0 | 12.373 |
| 1343.0 | 12.298 |
| 1344.0 | 12.208 |
| 1345.0 | 12.121 |
| 1346.0 | 12.05 |
| 1347.0 | 12.007 |
| 1348.0 | 11.938 |
| 1349.0 | 11.853 |
| 1350.0 | 11.779 |
| 1351.0 | 11.747 |
| 1352.0 | 11.677 |
| 1353.0 | 11.587 |
| 1354.0 | 11.491 |
| 1355.0 | 11.428 |
| 1356.0 | 11.325 |
| 1357.0 | 11.246 |
| 1358.0 | 11.175 |
| 1359.0 | 11.125 |
| 1360.0 | 11.059 |
| 1361.0 | 10.993 |
| 1362.0 | 10.922 |
| 1363.0 | 10.846 |
| 1364.0 | 10.758 |
| 1365.0 | 10.686 |
| 1366.0 | 10.613 |
| 1367.0 | 10.523 |
| 1368.0 | 10.477 |
| 1369.0 | 10.402 |
| 1370.0 | 10.367 |
| 1371.0 | 10.294 |
| 1372.0 | 10.245 |
| 1373.0 | 10.154 |
| 1374.0 | 10.095 |
| 1375.0 | 10.025 |
| 1376.0 | 9.947 |
| 1377.0 | 9.895 |
| 1378.0 | 9.848 |
| 1379.0 | 9.805 |
| 1380.0 | 9.749 |
| 1381.0 | 9.669 |
| 1382.0 | 9.597 |
| 1383.0 | 9.549 |
| 1384.0 | 9.519 |
| 1385.0 | 9.396 |
| 1386.0 | 9.326 |
| 1387.0 | 9.295 |
| 1388.0 | 9.219 |
| 1389.0 | 9.135 |
| 1390.0 | 9.066 |
| 1391.0 | 9.026 |
| 1392.0 | 8.947 |
| 1393.0 | 8.897 |
| 1394.0 | 8.858 |
| 1395.0 | 8.788 |
| 1396.0 | 8.688 |
| 1397.0 | 8.668 |
| 1398.0 | 8.613 |
| 1399.0 | 8.56 |
| 1400.0 | 8.508 |
| 1401.0 | 8.466 |
| 1402.0 | 8.363 |
| 1403.0 | 8.314 |
| 1404.0 | 8.288 |
| 1405.0 | 8.196 |
| 1406.0 | 8.165 |
| 1407.0 | 8.099 |
| 1408.0 | 8.054 |
| 1409.0 | 7.983 |
| 1410.0 | 7.96 |
| 1411.0 | 7.868 |
| 1412.0 | 7.83 |
| 1413.0 | 7.761 |
| 1414.0 | 7.72 |
| 1415.0 | 7.677 |
| 1416.0 | 7.627 |
| 1417.0 | 7.575 |
| 1418.0 | 7.511 |
| 1419.0 | 7.449 |
| 1420.0 | 7.401 |
| 1421.0 | 7.345 |
| 1422.0 | 7.281 |
| 1423.0 | 7.219 |
| 1424.0 | 7.16 |
| 1425.0 | 7.131 |
| 1426.0 | 7.115 |
| 1427.0 | 7.052 |
| 1428.0 | 6.982 |
| 1429.0 | 6.93 |
| 1430.0 | 6.865 |
| 1431.0 | 6.819 |
| 1432.0 | 6.761 |
| 1433.0 | 6.737 |
| 1434.0 | 6.683 |
| 1435.0 | 6.635 |
| 1436.0 | 6.573 |
| 1437.0 | 6.516 |
| 1438.0 | 6.471 |
| 1439.0 | 6.41 |
| 1440.0 | 6.368 |
| 1441.0 | 6.347 |
| 1442.0 | 6.309 |
| 1443.0 | 6.257 |
| 1444.0 | 6.175 |
| 1445.0 | 6.135 |
| 1446.0 | 6.081 |
| 1447.0 | 6.046 |
| 1448.0 | 5.998 |
| 1449.0 | 5.976 |
| 1450.0 | 5.933 |
| 1451.0 | 5.887 |
| 1452.0 | 5.82 |
| 1453.0 | 5.783 |
| 1454.0 | 5.753 |
| 1455.0 | 5.732 |
| 1456.0 | 5.684 |
| 1457.0 | 5.624 |
| 1458.0 | 5.583 |
| 1459.0 | 5.545 |
| 1460.0 | 5.521 |
| 1461.0 | 5.478 |
| 1462.0 | 5.413 |
| 1463.0 | 5.394 |
| 1464.0 | 5.33 |
| 1465.0 | 5.267 |
| 1466.0 | 5.254 |
| 1467.0 | 5.211 |
| 1468.0 | 5.157 |
| 1469.0 | 5.127 |
| 1470.0 | 5.13 |
| 1471.0 | 5.07 |
| 1472.0 | 4.983 |
| 1473.0 | 4.943 |
| 1474.0 | 4.943 |
| 1475.0 | 4.894 |
| 1476.0 | 4.853 |
| 1477.0 | 4.819 |
| 1478.0 | 4.766 |
| 1479.0 | 4.725 |
| 1480.0 | 4.699 |
| 1481.0 | 4.662 |
| 1482.0 | 4.626 |
| 1483.0 | 4.621 |
| 1484.0 | 4.563 |
| 1485.0 | 4.493 |
| 1486.0 | 4.472 |
| 1487.0 | 4.444 |
| 1488.0 | 4.421 |
| 1489.0 | 4.387 |
| 1490.0 | 4.334 |
| 1491.0 | 4.289 |
| 1492.0 | 4.27 |
| 1493.0 | 4.22 |
| 1494.0 | 4.191 |
| 1495.0 | 4.166 |
| 1496.0 | 4.152 |
| 1497.0 | 4.116 |
| 1498.0 | 4.096 |
| 1499.0 | 4.049 |
| 1500.0 | 4.019 |
| 1501.0 | 4.001 |
| 1502.0 | 3.97 |
| 1503.0 | 3.913 |
| 1504.0 | 3.893 |
| 1505.0 | 3.856 |
| 1506.0 | 3.824 |
| 1507.0 | 3.813 |
| 1508.0 | 3.803 |
| 1509.0 | 3.756 |
| 1510.0 | 3.698 |
| 1511.0 | 3.678 |
| 1512.0 | 3.655 |
| 1513.0 | 3.602 |
| 1514.0 | 3.566 |
| 1515.0 | 3.558 |
| 1516.0 | 3.507 |
| 1517.0 | 3.497 |
| 1518.0 | 3.466 |
| 1519.0 | 3.419 |
| 1520.0 | 3.412 |
| 1521.0 | 3.386 |
| 1522.0 | 3.345 |
| 1523.0 | 3.304 |
| 1524.0 | 3.258 |
| 1525.0 | 3.266 |
| 1526.0 | 3.25 |
| 1527.0 | 3.223 |
| 1528.0 | 3.195 |
| 1529.0 | 3.173 |
| 1530.0 | 3.15 |
| 1531.0 | 3.146 |
| 1532.0 | 3.116 |
| 1533.0 | 3.087 |
| 1534.0 | 3.047 |
| 1535.0 | 2.988 |
| 1536.0 | 2.958 |
| 1537.0 | 2.952 |
| 1538.0 | 2.92 |
| 1539.0 | 2.883 |
| 1540.0 | 2.861 |
| 1541.0 | 2.866 |
| 1542.0 | 2.856 |
| 1543.0 | 2.832 |
| 1544.0 | 2.804 |
| 1545.0 | 2.772 |
| 1546.0 | 2.756 |
| 1547.0 | 2.722 |
| 1548.0 | 2.702 |
| 1549.0 | 2.682 |
| 1550.0 | 2.663 |
| 1551.0 | 2.624 |
| 1552.0 | 2.57 |
| 1553.0 | 2.547 |
| 1554.0 | 2.561 |
| 1555.0 | 2.56 |
| 1556.0 | 2.536 |
| 1557.0 | 2.507 |
| 1558.0 | 2.491 |
| 1559.0 | 2.459 |
| 1560.0 | 2.432 |
| 1561.0 | 2.43 |
| 1562.0 | 2.406 |
| 1563.0 | 2.394 |
| 1564.0 | 2.4 |
| 1565.0 | 2.366 |
| 1566.0 | 2.358 |
| 1567.0 | 2.334 |
| 1568.0 | 2.298 |
| 1569.0 | 2.276 |
| 1570.0 | 2.259 |
| 1571.0 | 2.259 |
| 1572.0 | 2.229 |
| 1573.0 | 2.205 |
| 1574.0 | 2.176 |
| 1575.0 | 2.155 |
| 1576.0 | 2.153 |
| 1577.0 | 2.13 |
| 1578.0 | 2.112 |
| 1579.0 | 2.089 |
| 1580.0 | 2.069 |
| 1581.0 | 2.066 |
| 1582.0 | 2.052 |
| 1583.0 | 2.029 |
| 1584.0 | 2.015 |
| 1585.0 | 1.982 |
| 1586.0 | 1.965 |
| 1587.0 | 1.95 |
| 1588.0 | 1.955 |
| 1589.0 | 1.959 |
| 1590.0 | 1.944 |
| 1591.0 | 1.903 |
| 1592.0 | 1.901 |
| 1593.0 | 1.909 |
| 1594.0 | 1.896 |
| 1595.0 | 1.843 |
| 1596.0 | 1.813 |
| 1597.0 | 1.811 |
| 1598.0 | 1.783 |
| 1599.0 | 1.777 |
| 1600.0 | 1.779 |
| 1601.0 | 1.769 |
| 1602.0 | 1.736 |
| 1603.0 | 1.717 |
| 1604.0 | 1.695 |
| 1605.0 | 1.685 |
| 1606.0 | 1.69 |
| 1607.0 | 1.675 |
| 1608.0 | 1.678 |
| 1609.0 | 1.671 |
| 1610.0 | 1.656 |
| 1611.0 | 1.632 |
| 1612.0 | 1.614 |
| 1613.0 | 1.615 |
| 1614.0 | 1.591 |
| 1615.0 | 1.57 |
| 1616.0 | 1.578 |
| 1617.0 | 1.568 |
| 1618.0 | 1.565 |
| 1619.0 | 1.548 |
| 1620.0 | 1.503 |
| 1621.0 | 1.507 |
| 1622.0 | 1.513 |
| 1623.0 | 1.515 |
| 1624.0 | 1.494 |
| 1625.0 | 1.465 |
| 1626.0 | 1.441 |
| 1627.0 | 1.455 |
| 1628.0 | 1.488 |
| 1629.0 | 1.437 |
| 1630.0 | 1.401 |
| 1631.0 | 1.394 |
| 1632.0 | 1.387 |
| 1633.0 | 1.381 |
| 1634.0 | 1.355 |
| 1635.0 | 1.388 |
| 1636.0 | 1.395 |
| 1637.0 | 1.369 |
| 1638.0 | 1.339 |
| 1639.0 | 1.327 |
| 1640.0 | 1.317 |
| 1641.0 | 1.301 |
| 1642.0 | 1.293 |
| 1643.0 | 1.268 |
| 1644.0 | 1.308 |
| 1645.0 | 1.321 |
| 1646.0 | 1.267 |
| 1647.0 | 1.274 |
| 1648.0 | 1.29 |
| 1649.0 | 1.231 |
| 1650.0 | 1.211 |
| 1651.0 | 1.246 |
| 1652.0 | 1.272 |
| 1653.0 | 1.245 |
| 1654.0 | 1.238 |
| 1655.0 | 1.234 |
| 1656.0 | 1.178 |
| 1657.0 | 1.164 |
| 1658.0 | 1.161 |
| 1659.0 | 1.19 |
| 1660.0 | 1.207 |
| 1661.0 | 1.197 |
| 1662.0 | 1.123 |
| 1663.0 | 1.107 |
| 1664.0 | 1.176 |
| 1665.0 | 1.164 |
| 1666.0 | 1.124 |
| 1667.0 | 1.115 |
| 1668.0 | 1.12 |
| 1669.0 | 1.087 |
| 1670.0 | 1.088 |
| 1671.0 | 1.133 |
| 1672.0 | 1.092 |
| 1673.0 | 1.084 |
| 1674.0 | 1.093 |
| 1675.0 | 1.022 |
| 1676.0 | 1.034 |
| 1677.0 | 1.049 |
| 1678.0 | 1.029 |
| 1679.0 | 1.111 |
| 1680.0 | 1.037 |
| 1681.0 | 1.006 |
| 1682.0 | 1.007 |
| 1683.0 | 1.012 |
| 1684.0 | 1.073 |
| 1685.0 | 1.081 |
| 1686.0 | 1.002 |
| 1687.0 | 1.024 |
| 1688.0 | 0.962 |
| 1689.0 | 0.976 |
| 1690.0 | 0.989 |
| 1691.0 | 1.013 |
| 1692.0 | 1.021 |
| 1693.0 | 1.043 |
| 1694.0 | 0.992 |
| 1695.0 | 0.99 |
| 1696.0 | 0.975 |
| 1697.0 | 0.973 |
| 1698.0 | 0.925 |
| 1699.0 | 1.008 |
| 1700.0 | 0.956 |
| 1701.0 | 0.999 |
| 1702.0 | 0.985 |
| 1703.0 | 1.018 |
| 1704.0 | 0.984 |
| 1705.0 | 0.97 |
| 1706.0 | 0.957 |
| 1707.0 | 0.924 |
| 1708.0 | 0.931 |
| 1709.0 | 0.907 |
| 1710.0 | 0.918 |
| 1711.0 | 0.938 |
| 1712.0 | 0.975 |
| 1713.0 | 0.97 |
| 1714.0 | 0.887 |
| 1715.0 | 0.923 |
| 1716.0 | 0.94 |
| 1717.0 | 0.959 |
| 1718.0 | 0.906 |
| 1719.0 | 0.907 |
| 1720.0 | 0.841 |
| 1721.0 | 0.883 |
| 1722.0 | 0.89 |
| 1723.0 | 0.924 |
| 1724.0 | 0.862 |
| 1725.0 | 0.843 |
| 1726.0 | 0.812 |
| 1727.0 | 0.849 |
| 1728.0 | 0.917 |
| 1729.0 | 0.908 |
| 1730.0 | 0.822 |
| 1731.0 | 0.933 |
| 1732.0 | 0.884 |
| 1733.0 | 0.832 |
| 1734.0 | 0.869 |
| 1735.0 | 0.884 |
| 1736.0 | 0.878 |
| 1737.0 | 0.831 |
| 1738.0 | 0.857 |
| 1739.0 | 0.876 |
| 1740.0 | 0.81 |
| 1741.0 | 0.853 |
| 1742.0 | 0.85 |
| 1743.0 | 0.943 |
| 1744.0 | 0.909 |
| 1745.0 | 0.808 |
| 1746.0 | 0.862 |
| 1747.0 | 0.837 |
| 1748.0 | 0.9 |
| 1749.0 | 0.911 |
| 1750.0 | 0.836 |
| 1751.0 | 0.85 |
| 1752.0 | 0.78 |
| 1753.0 | 0.841 |
| 1754.0 | 0.811 |
| 1755.0 | 0.846 |
| 1756.0 | 0.816 |
| 1757.0 | 0.763 |
| 1758.0 | 0.855 |
| 1759.0 | 0.88 |
| 1760.0 | 0.811 |
| 1761.0 | 0.818 |
| 1762.0 | 0.808 |
| 1763.0 | 0.795 |
| 1764.0 | 0.818 |
| 1765.0 | 0.843 |
| 1766.0 | 0.856 |
| 1767.0 | 0.867 |
| 1768.0 | 0.788 |
| 1769.0 | 0.811 |
| 1770.0 | 0.773 |
| 1771.0 | 0.778 |
| 1772.0 | 0.824 |
| 1773.0 | 0.866 |
| 1774.0 | 0.875 |
| 1775.0 | 0.818 |
| 1776.0 | 0.85 |
| 1777.0 | 0.857 |
| 1778.0 | 0.868 |
| 1779.0 | 0.843 |
| 1780.0 | 0.897 |
| 1781.0 | 0.851 |
| 1782.0 | 0.809 |
| 1783.0 | 0.844 |
| 1784.0 | 0.834 |
| 1785.0 | 0.805 |
| 1786.0 | 0.864 |
| 1787.0 | 0.83 |
| 1788.0 | 0.942 |
| 1789.0 | 0.826 |
| 1790.0 | 0.815 |
| 1791.0 | 0.841 |
| 1792.0 | 0.818 |
| 1793.0 | 0.74 |
| 1794.0 | 0.713 |
| 1795.0 | 0.772 |
| 1796.0 | 0.768 |
| 1797.0 | 0.757 |
| 1798.0 | 0.871 |
| 1799.0 | 0.878 |
| 1800.0 | 0.853 |
| 1801.0 | 0.841 |
| 1802.0 | 0.789 |
| 1803.0 | 0.782 |
| 1804.0 | 0.846 |
| 1805.0 | 0.825 |
| 1806.0 | 0.774 |
| 1807.0 | 0.857 |
| 1808.0 | 0.888 |
| 1809.0 | 0.853 |
| 1810.0 | 0.863 |
| 1811.0 | 0.832 |
| 1812.0 | 0.815 |
| 1813.0 | 0.846 |
| 1814.0 | 0.834 |
| 1815.0 | 0.844 |
| 1816.0 | 0.839 |
| 1817.0 | 0.874 |
| 1818.0 | 0.851 |
| 1819.0 | 0.844 |
| 1820.0 | 0.846 |
| 1821.0 | 0.883 |
| 1822.0 | 0.905 |
| 1823.0 | 0.868 |
| 1824.0 | 0.852 |
| 1825.0 | 0.856 |
| 1826.0 | 0.847 |
| 1827.0 | 0.829 |
| 1828.0 | 0.824 |
| 1829.0 | 0.824 |
| 1830.0 | 0.816 |
| 1831.0 | 0.845 |
| 1832.0 | 0.879 |
| 1833.0 | 0.846 |
| 1834.0 | 0.859 |
| 1835.0 | 0.883 |
| 1836.0 | 0.891 |
| 1837.0 | 0.897 |
| 1838.0 | 0.892 |
| 1839.0 | 0.874 |
| 1840.0 | 0.889 |
| 1841.0 | 0.867 |
| 1842.0 | 0.826 |
| 1843.0 | 0.863 |
| 1844.0 | 0.907 |
| 1845.0 | 0.924 |
| 1846.0 | 0.927 |
| 1847.0 | 0.889 |
| 1848.0 | 0.882 |
| 1849.0 | 0.905 |
| 1850.0 | 0.881 |
| 1851.0 | 0.906 |
| 1852.0 | 0.914 |
| 1853.0 | 0.919 |
| 1854.0 | 0.871 |
| 1855.0 | 0.881 |
| 1856.0 | 0.892 |
| 1857.0 | 0.866 |
| 1858.0 | 0.855 |
| 1859.0 | 0.909 |
| 1860.0 | 0.934 |
| 1861.0 | 0.921 |
| 1862.0 | 0.886 |
| 1863.0 | 0.908 |
| 1864.0 | 0.907 |
| 1865.0 | 0.916 |
| 1866.0 | 0.891 |
| 1867.0 | 0.921 |
| 1868.0 | 0.897 |
| 1869.0 | 0.914 |
| 1870.0 | 0.94 |
| 1871.0 | 0.922 |
| 1872.0 | 0.89 |
| 1873.0 | 0.923 |
| 1874.0 | 0.908 |
| 1875.0 | 0.885 |
| 1876.0 | 0.882 |
| 1877.0 | 0.869 |
| 1878.0 | 0.867 |
| 1879.0 | 0.899 |
| 1880.0 | 0.913 |
| 1881.0 | 0.859 |
| 1882.0 | 0.868 |
| 1883.0 | 0.853 |
| 1884.0 | 0.871 |
| 1885.0 | 0.871 |
| 1886.0 | 0.917 |
| 1887.0 | 0.913 |
| 1888.0 | 0.89 |
| 1889.0 | 0.911 |
| 1890.0 | 0.967 |
| 1891.0 | 0.939 |
| 1892.0 | 0.892 |
| 1893.0 | 0.914 |
| 1894.0 | 0.968 |
| 1895.0 | 0.989 |
| 1896.0 | 0.958 |
| 1897.0 | 0.919 |
| 1898.0 | 0.925 |
| 1899.0 | 0.931 |
| 1900.0 | 0.918 |
| 1901.0 | 0.938 |
| 1902.0 | 1.006 |
| 1903.0 | 0.994 |
| 1904.0 | 0.963 |
| 1905.0 | 0.955 |
| 1906.0 | 0.902 |
| 1907.0 | 0.924 |
| 1908.0 | 0.936 |
| 1909.0 | 0.933 |
| 1910.0 | 0.948 |
| 1911.0 | 0.979 |
| 1912.0 | 0.955 |
| 1913.0 | 0.938 |
| 1914.0 | 0.976 |
| 1915.0 | 0.979 |
| 1916.0 | 0.913 |
| 1917.0 | 0.936 |
| 1918.0 | 0.979 |
| 1919.0 | 1.016 |
| 1920.0 | 1.017 |
| 1921.0 | 1.01 |
| 1922.0 | 1.012 |
| 1923.0 | 0.989 |
| 1924.0 | 0.962 |
| 1925.0 | 0.992 |
| 1926.0 | 0.999 |
| 1927.0 | 0.997 |
| 1928.0 | 0.958 |
| 1929.0 | 0.925 |
| 1930.0 | 0.933 |
| 1931.0 | 0.974 |
| 1932.0 | 0.97 |
| 1933.0 | 0.972 |
| 1934.0 | 0.992 |
| 1935.0 | 0.987 |
| 1936.0 | 1.001 |
| 1937.0 | 0.991 |
| 1938.0 | 0.974 |
| 1939.0 | 0.951 |
| 1940.0 | 0.993 |
| 1941.0 | 1.018 |
| 1942.0 | 1.016 |
| 1943.0 | 1.013 |
| 1944.0 | 0.995 |
| 1945.0 | 0.984 |
| 1946.0 | 0.969 |
| 1947.0 | 0.951 |
| 1948.0 | 0.965 |
| 1949.0 | 0.99 |
| 1950.0 | 1.009 |
| 1951.0 | 1.035 |
| 1952.0 | 1.047 |
| 1953.0 | 1.053 |
| 1954.0 | 1.03 |
| 1955.0 | 1.02 |
| 1956.0 | 1.04 |
| 1957.0 | 1.042 |
| 1958.0 | 1.035 |
| 1959.0 | 1.044 |
| 1960.0 | 1.042 |
| 1961.0 | 1.038 |
| 1962.0 | 1.037 |
| 1963.0 | 1.016 |
| 1964.0 | 0.998 |
| 1965.0 | 0.997 |
| 1966.0 | 1.026 |
| 1967.0 | 1.045 |
| 1968.0 | 1.063 |
| 1969.0 | 1.056 |
| 1970.0 | 1.045 |
| 1971.0 | 1.064 |
| 1972.0 | 1.04 |
| 1973.0 | 1.029 |
| 1974.0 | 1.054 |
| 1975.0 | 1.064 |
| 1976.0 | 1.07 |
| 1977.0 | 1.041 |
| 1978.0 | 1.018 |
| 1979.0 | 1.012 |
| 1980.0 | 1.04 |
| 1981.0 | 1.042 |
| 1982.0 | 1.049 |
| 1983.0 | 1.056 |
| 1984.0 | 1.081 |
| 1985.0 | 1.091 |
| 1986.0 | 1.089 |
| 1987.0 | 1.094 |
| 1988.0 | 1.062 |
| 1989.0 | 1.021 |
| 1990.0 | 1.041 |
| 1991.0 | 1.026 |
| 1992.0 | 1.024 |
| 1993.0 | 1.029 |
| 1994.0 | 1.055 |
| 1995.0 | 1.077 |
| 1996.0 | 1.071 |
| 1997.0 | 1.073 |
| 1998.0 | 1.068 |
| 1999.0 | 1.06 |
| 2000.0 | 1.042 |
| 2001.0 | 1.052 |
| 2002.0 | 1.081 |
| 2003.0 | 1.092 |
| 2004.0 | 1.082 |
| 2005.0 | 1.081 |
| 2006.0 | 1.093 |
| 2007.0 | 1.108 |
| 2008.0 | 1.078 |
| 2009.0 | 1.064 |
| 2010.0 | 1.069 |
| 2011.0 | 1.088 |
| 2012.0 | 1.065 |
| 2013.0 | 1.047 |
| 2014.0 | 1.056 |
| 2015.0 | 1.092 |
| 2016.0 | 1.085 |
| 2017.0 | 1.09 |
| 2018.0 | 1.094 |
| 2019.0 | 1.082 |
| 2020.0 | 1.062 |
| 2021.0 | 1.098 |
| 2022.0 | 1.139 |
| 2023.0 | 1.119 |
| 2024.0 | 1.091 |
| 2025.0 | 1.103 |
| 2026.0 | 1.037 |
| 2027.0 | 1.044 |
| 2028.0 | 1.077 |
| 2029.0 | 1.068 |
| 2030.0 | 1.069 |
| 2031.0 | 1.069 |
| 2032.0 | 1.057 |
| 2033.0 | 1.079 |
| 2034.0 | 1.065 |
| 2035.0 | 1.063 |
| 2036.0 | 1.078 |
| 2037.0 | 1.075 |
| 2038.0 | 1.101 |
| 2039.0 | 1.073 |
| 2040.0 | 1.062 |
| 2041.0 | 1.094 |
| 2042.0 | 1.091 |
| 2043.0 | 1.086 |
| 2044.0 | 1.104 |
| 2045.0 | 1.118 |
| 2046.0 | 1.093 |
| 2047.0 | 1.081 |
| 2048.0 | 1.087 |
| 2049.0 | 1.114 |
| 2050.0 | 1.11 |
| 2051.0 | 1.068 |
| 2052.0 | 1.078 |
| 2053.0 | 1.066 |
| 2054.0 | 1.079 |
| 2055.0 | 1.1 |
| 2056.0 | 1.146 |
| 2057.0 | 1.118 |
| 2058.0 | 1.108 |
| 2059.0 | 1.044 |
| 2060.0 | 1.043 |
| 2061.0 | 1.056 |
| 2062.0 | 1.066 |
| 2063.0 | 1.115 |
| 2064.0 | 1.062 |
| 2065.0 | 1.097 |
| 2066.0 | 1.171 |
| 2067.0 | 1.099 |
| 2068.0 | 1.057 |
| 2069.0 | 1.092 |
| 2070.0 | 1.105 |
| 2071.0 | 1.118 |
| 2072.0 | 1.116 |
| 2073.0 | 1.15 |
| 2074.0 | 1.051 |
| 2075.0 | 1.064 |
| 2076.0 | 1.087 |
| 2077.0 | 1.018 |
| 2078.0 | 1.12 |
| 2079.0 | 1.132 |
| 2080.0 | 1.103 |
| 2081.0 | 1.099 |
| 2082.0 | 1.118 |
| 2083.0 | 1.157 |
| 2084.0 | 1.12 |
| 2085.0 | 1.096 |
| 2086.0 | 1.085 |
| 2087.0 | 1.107 |
| 2088.0 | 1.107 |
| 2089.0 | 1.11 |
| 2090.0 | 1.133 |
| 2091.0 | 1.103 |
| 2092.0 | 1.101 |
| 2093.0 | 1.075 |
| 2094.0 | 1.12 |
| 2095.0 | 1.127 |
| 2096.0 | 1.114 |
| 2097.0 | 1.091 |
| 2098.0 | 1.151 |
| 2099.0 | 1.109 |
| 2100.0 | 1.079 |
| 2101.0 | 1.102 |
| 2102.0 | 1.178 |
| 2103.0 | 1.111 |
| 2104.0 | 1.13 |
| 2105.0 | 1.069 |
| 2106.0 | 1.097 |
| 2107.0 | 1.155 |
| 2108.0 | 1.166 |
| 2109.0 | 1.112 |
| 2110.0 | 1.073 |
| 2111.0 | 1.04 |
| 2112.0 | 1.108 |
| 2113.0 | 1.167 |
| 2114.0 | 1.18 |
| 2115.0 | 1.154 |
| 2116.0 | 1.092 |
| 2117.0 | 1.062 |
| 2118.0 | 1.204 |
| 2119.0 | 1.138 |
| 2120.0 | 1.116 |
| 2121.0 | 1.145 |
| 2122.0 | 1.142 |
| 2123.0 | 1.088 |
| 2124.0 | 1.166 |
| 2125.0 | 1.211 |
| 2126.0 | 1.154 |
| 2127.0 | 1.101 |
| 2128.0 | 1.086 |
| 2129.0 | 1.137 |
| 2130.0 | 1.154 |
| 2131.0 | 1.102 |
| 2132.0 | 1.104 |
| 2133.0 | 1.018 |
| 2134.0 | 1.033 |
| 2135.0 | 1.125 |
| 2136.0 | 1.129 |
| 2137.0 | 1.183 |
| 2138.0 | 1.162 |
| 2139.0 | 1.145 |
| 2140.0 | 1.167 |
| 2141.0 | 1.14 |
| 2142.0 | 1.17 |
| 2143.0 | 1.187 |
| 2144.0 | 1.095 |
| 2145.0 | 1.116 |
| 2146.0 | 1.103 |
| 2147.0 | 1.157 |
| 2148.0 | 1.101 |
| 2149.0 | 1.073 |
| 2150.0 | 1.008 |
| 2151.0 | 1.158 |
| 2152.0 | 1.179 |
| 2153.0 | 1.165 |
| 2154.0 | 1.101 |
| 2155.0 | 1.187 |
| 2156.0 | 1.151 |
| 2157.0 | 1.139 |
| 2158.0 | 1.198 |
| 2159.0 | 1.166 |
| 2160.0 | 1.132 |
| 2161.0 | 1.14 |
| 2162.0 | 1.156 |
| 2163.0 | 1.156 |
| 2164.0 | 1.1 |
| 2165.0 | 1.104 |
| 2166.0 | 1.114 |
| 2167.0 | 1.079 |
| 2168.0 | 1.046 |
| 2169.0 | 1.059 |
| 2170.0 | 1.157 |
| 2171.0 | 1.169 |
| 2172.0 | 1.214 |
| 2173.0 | 1.184 |
| 2174.0 | 1.206 |
| 2175.0 | 1.107 |
| 2176.0 | 1.041 |
| 2177.0 | 0.987 |
| 2178.0 | 1.111 |
| 2179.0 | 1.118 |
| 2180.0 | 1.065 |
| 2181.0 | 1.079 |
| 2182.0 | 1.166 |
| 2183.0 | 1.156 |
| 2184.0 | 1.161 |
| 2185.0 | 1.088 |
| 2186.0 | 1.138 |
| 2187.0 | 1.06 |
| 2188.0 | 1.108 |
| 2189.0 | 1.159 |
| 2190.0 | 1.039 |
| 2191.0 | 1.108 |
| 2192.0 | 1.16 |
| 2193.0 | 1.153 |
| 2194.0 | 1.173 |
| 2195.0 | 1.196 |
| 2196.0 | 1.16 |
| 2197.0 | 1.147 |
| 2198.0 | 1.224 |
| 2199.0 | 1.177 |
| 2200.0 | 1.114 |
| 2201.0 | 1.097 |
| 2202.0 | 1.124 |
| 2203.0 | 1.135 |
| 2204.0 | 1.166 |
| 2205.0 | 1.13 |
| 2206.0 | 1.04 |
| 2207.0 | 1.115 |
| 2208.0 | 1.073 |
| 2209.0 | 1.046 |
| 2210.0 | 1.052 |
| 2211.0 | 1.133 |
| 2212.0 | 1.027 |
| 2213.0 | 1.046 |
| 2214.0 | 1.145 |
| 2215.0 | 1.15 |
| 2216.0 | 1.191 |
| 2217.0 | 1.145 |
| 2218.0 | 1.105 |
| 2219.0 | 0.952 |
| 2220.0 | 1.037 |
| 2221.0 | 1.148 |
| 2222.0 | 1.183 |
| 2223.0 | 1.073 |
| 2224.0 | 1.087 |
| 2225.0 | 1.027 |
| 2226.0 | 1 |
| 2227.0 | 1.016 |
| 2228.0 | 1.106 |
| 2229.0 | 1.104 |
| 2230.0 | 1.075 |
| 2231.0 | 1.104 |
| 2232.0 | 1.109 |
| 2233.0 | 1.013 |
| 2234.0 | 1.043 |
| 2235.0 | 0.993 |
| 2236.0 | 1.049 |
| 2237.0 | 1.003 |
| 2238.0 | 1.074 |
| 2239.0 | 1.057 |
| 2240.0 | 1.004 |
| 2241.0 | 1.086 |
| 2242.0 | 1.037 |
| 2243.0 | 1.037 |
| 2244.0 | 1.073 |
| 2245.0 | 1.1 |
| 2246.0 | 1.173 |
| 2247.0 | 1.174 |
| 2248.0 | 1.062 |
| 2249.0 | 1.013 |
| 2250.0 | 1.012 |
| 2251.0 | 1.133 |
| 2252.0 | 1.084 |
| 2253.0 | 1.026 |
| 2254.0 | 1.02 |
| 2255.0 | 1.035 |
| 2256.0 | 1.046 |
| 2257.0 | 1.087 |
| 2258.0 | 1.077 |
| 2259.0 | 1.056 |
| 2260.0 | 1.046 |
| 2261.0 | 1.033 |
| 2262.0 | 1.072 |
| 2263.0 | 1.091 |
| 2264.0 | 1.101 |
| 2265.0 | 1.066 |
| 2266.0 | 1.023 |
| 2267.0 | 0.986 |
| 2268.0 | 1.017 |
| 2269.0 | 1.087 |
| 2270.0 | 1.064 |
| 2271.0 | 1.046 |
| 2272.0 | 0.988 |
| 2273.0 | 0.984 |
| 2274.0 | 0.976 |
| 2275.0 | 1.024 |
| 2276.0 | 1.054 |
| 2277.0 | 1.021 |
| 2278.0 | 1.079 |
| 2279.0 | 1.102 |
| 2280.0 | 1.085 |
| 2281.0 | 1.062 |
| 2282.0 | 1.025 |
| 2283.0 | 0.957 |
| 2284.0 | 0.967 |
| 2285.0 | 1.007 |
| 2286.0 | 1.127 |
| 2287.0 | 1.094 |
| 2288.0 | 1.063 |
| 2289.0 | 1.017 |
| 2290.0 | 0.975 |
| 2291.0 | 0.947 |
| 2292.0 | 0.941 |
| 2293.0 | 1.014 |
| 2294.0 | 1.029 |
| 2295.0 | 1.011 |
| 2296.0 | 1.055 |
| 2297.0 | 1.07 |
| 2298.0 | 1.164 |
| 2299.0 | 1.167 |
| 2300.0 | 1.064 |
| 2301.0 | 0.994 |
| 2302.0 | 1.012 |
| 2303.0 | 1.066 |
| 2304.0 | 1.087 |
| 2305.0 | 1.079 |
| 2306.0 | 1.004 |
| 2307.0 | 0.89 |
| 2308.0 | 0.883 |
| 2309.0 | 0.948 |
| 2310.0 | 0.992 |
| 2311.0 | 0.939 |
| 2312.0 | 1 |
| 2313.0 | 1.091 |
| 2314.0 | 1.058 |
| 2315.0 | 1.053 |
| 2316.0 | 1.052 |
| 2317.0 | 1.059 |
| 2318.0 | 1.026 |
| 2319.0 | 0.989 |
| 2320.0 | 1.055 |
| 2321.0 | 1.07 |
| 2322.0 | 1.038 |
| 2323.0 | 1.044 |
| 2324.0 | 0.933 |
| 2325.0 | 0.935 |
| 2326.0 | 1.028 |
| 2327.0 | 1.118 |
| 2328.0 | 0.993 |
| 2329.0 | 0.888 |
| 2330.0 | 0.973 |
| 2331.0 | 0.992 |
| 2332.0 | 0.941 |
| 2333.0 | 0.913 |
| 2334.0 | 0.927 |
| 2335.0 | 0.999 |
| 2336.0 | 1.041 |
| 2337.0 | 1.029 |
| 2338.0 | 1.05 |
| 2339.0 | 1.039 |
| 2340.0 | 1.01 |
| 2341.0 | 1.047 |
| 2342.0 | 0.974 |
| 2343.0 | 0.932 |
| 2344.0 | 0.92 |
| 2345.0 | 0.922 |
| 2346.0 | 0.903 |
| 2347.0 | 0.977 |
| 2348.0 | 1.071 |
| 2349.0 | 1.1 |
| 2350.0 | 1.172 |
| 2351.0 | 1.121 |
| 2352.0 | 0.974 |
| 2353.0 | 1.033 |
| 2354.0 | 0.97 |
| 2355.0 | 0.961 |
| 2356.0 | 0.984 |
| 2357.0 | 0.988 |
| 2358.0 | 1.088 |
| 2359.0 | 1.145 |
| 2360.0 | 1 |
| 2361.0 | 0.969 |
| 2362.0 | 1.013 |
| 2363.0 | 0.994 |
| 2364.0 | 1.104 |
| 2365.0 | 1.192 |
| 2366.0 | 1.031 |
| 2367.0 | 0.859 |
| 2368.0 | 0.872 |
| 2369.0 | 0.872 |
| 2370.0 | 0.897 |
| 2371.0 | 1.028 |
| 2372.0 | 1.134 |
| 2373.0 | 1.058 |
| 2374.0 | 1.037 |
| 2375.0 | 1.019 |
| 2376.0 | 0.997 |
| 2377.0 | 1.016 |
| 2378.0 | 0.964 |
| 2379.0 | 1.004 |
| 2380.0 | 1.007 |
| 2381.0 | 1.039 |
| 2382.0 | 1.059 |
| 2383.0 | 0.936 |
| 2384.0 | 0.74 |
| 2385.0 | 0.822 |
| 2386.0 | 0.992 |
| 2387.0 | 1.014 |
| 2388.0 | 0.93 |
| 2389.0 | 0.974 |
| 2390.0 | 0.976 |
| 2391.0 | 0.822 |
| 2392.0 | 0.896 |
| 2393.0 | 0.923 |
| 2394.0 | 1.031 |
| 2395.0 | 0.955 |
| 2396.0 | 0.876 |
| 2397.0 | 0.786 |
| 2398.0 | 0.739 |
| 2399.0 | 0.799 |
| 2400.0 | 0.87 |
| 2401.0 | 0.939 |
| 2402.0 | 0.872 |
| 2403.0 | 0.74 |
| 2404.0 | 0.768 |
| 2405.0 | 0.875 |
| 2406.0 | 0.906 |
| 2407.0 | 0.931 |
| 2408.0 | 0.988 |
| 2409.0 | 0.973 |
| 2410.0 | 0.857 |
| 2411.0 | 0.992 |
| 2412.0 | 0.944 |
| 2413.0 | 0.778 |
| 2414.0 | 0.799 |
| 2415.0 | 0.881 |
| 2416.0 | 1.043 |
| 2417.0 | 1.147 |
| 2418.0 | 0.968 |
| 2419.0 | 0.916 |
| 2420.0 | 0.878 |
| 2421.0 | 0.902 |
| 2422.0 | 0.958 |
| 2423.0 | 0.841 |
| 2424.0 | 0.897 |
| 2425.0 | 0.758 |
| 2426.0 | 0.895 |
| 2427.0 | 0.808 |
| 2428.0 | 0.948 |
| 2429.0 | 0.968 |
| 2430.0 | 0.97 |
| 2431.0 | 0.929 |
| 2432.0 | 0.895 |
| 2433.0 | 0.865 |
| 2434.0 | 0.863 |
| 2435.0 | 1.085 |
| 2436.0 | 1.017 |
| 2437.0 | 1.008 |
| 2438.0 | 0.938 |
| 2439.0 | 1.041 |
| 2440.0 | 1.107 |
| 2441.0 | 0.976 |
| 2442.0 | 0.993 |
| 2443.0 | 0.816 |
| 2444.0 | 0.97 |
| 2445.0 | 1.03 |
| 2446.0 | 0.935 |
| 2447.0 | 0.873 |
| 2448.0 | 0.846 |
| 2449.0 | 0.867 |
| 2450.0 | 0.751 |
| 2451.0 | 0.881 |
| 2452.0 | 0.924 |
| 2453.0 | 0.849 |
| 2454.0 | 0.875 |
| 2455.0 | 0.755 |
| 2456.0 | 0.659 |
| 2457.0 | 0.806 |
| 2458.0 | 0.892 |
| 2459.0 | 0.845 |
| 2460.0 | 0.895 |
| 2461.0 | 1.023 |
| 2462.0 | 0.844 |
| 2463.0 | 0.904 |
| 2464.0 | 0.766 |
| 2465.0 | 0.839 |
| 2466.0 | 0.511 |
| 2467.0 | 0.703 |
| 2468.0 | 0.852 |
| 2469.0 | 0.837 |
| 2470.0 | 1.032 |
| 2471.0 | 1.036 |
| 2472.0 | 0.84 |
| 2473.0 | 0.771 |
| 2474.0 | 0.866 |
| 2475.0 | 0.884 |
| 2476.0 | 0.947 |
| 2477.0 | 0.718 |
| 2478.0 | 0.776 |
| 2479.0 | 0.889 |
| 2480.0 | 0.933 |
| 2481.0 | 0.898 |
| 2482.0 | 0.915 |
| 2483.0 | 0.869 |
| 2484.0 | 0.842 |
| 2485.0 | 0.821 |
| 2486.0 | 0.805 |
| 2487.0 | 0.863 |
| 2488.0 | 0.891 |
| 2489.0 | 0.873 |
| 2490.0 | 0.853 |
| 2491.0 | 0.779 |
| 2492.0 | 0.844 |
| 2493.0 | 0.784 |
| 2494.0 | 0.87 |
| 2495.0 | 0.816 |
| 2496.0 | 0.85 |
| 2497.0 | 0.92 |
| 2498.0 | 0.881 |
| 2499.0 | 0.835 |
| 2500.0 | 0.85 |
| 2502.16 | 0.856 |
| 2511.82 | 0.85 |
| 2521.48 | 0.846 |
| 2531.14 | 0.84 |
| 2540.8 | 0.837 |
| 2550.46 | 0.829 |
| 2560.12 | 0.828 |
| 2569.78 | 0.824 |
| 2579.44 | 0.811 |
| 2589.1 | 0.81 |
| 2598.77 | 0.799 |
| 2608.43 | 0.787 |
| 2618.09 | 0.795 |
| 2627.75 | 0.792 |
| 2637.41 | 0.774 |
| 2647.07 | 0.773 |
| 2656.73 | 0.766 |
| 2666.39 | 0.77 |
| 2676.05 | 0.757 |
| 2685.71 | 0.735 |
| 2695.37 | 0.716 |
| 2705.04 | 0.684 |
| 2714.7 | 0.671 |
| 2724.36 | 0.668 |
| 2734.02 | 0.651 |
| 2743.68 | 0.661 |
| 2753.34 | 0.67 |
| 2763.0 | 0.692 |
| 2772.66 | 0.714 |
| 2782.32 | 0.74 |
| 2791.98 | 0.765 |
| 2801.64 | 0.797 |
| 2811.3 | 0.826 |
| 2820.97 | 0.843 |
| 2830.63 | 0.874 |
| 2840.29 | 0.898 |
| 2849.95 | 0.922 |
| 2859.61 | 0.932 |
| 2869.27 | 0.953 |
| 2878.93 | 0.97 |
| 2888.59 | 0.982 |
| 2898.25 | 1.008 |
| 2907.91 | 1.012 |
| 2917.57 | 1.024 |
| 2927.23 | 1.045 |
| 2936.9 | 1.05 |
| 2946.56 | 1.053 |
| 2956.22 | 1.071 |
| 2965.88 | 1.075 |
| 2975.54 | 1.082 |
| 2985.2 | 1.086 |
| 2994.86 | 1.094 |
| 3004.52 | 1.104 |
| 3014.18 | 1.116 |
| 3023.84 | 1.102 |
| 3033.5 | 1.116 |
| 3043.16 | 1.133 |
| 3052.83 | 1.135 |
| 3062.49 | 1.147 |
| 3072.15 | 1.156 |
| 3081.81 | 1.159 |
| 3091.47 | 1.166 |
| 3101.13 | 1.185 |
| 3110.79 | 1.188 |
| 3120.45 | 1.189 |
| 3130.11 | 1.207 |
| 3139.77 | 1.209 |
| 3149.43 | 1.222 |
| 3159.09 | 1.234 |
| 3168.76 | 1.24 |
| 3178.42 | 1.244 |
| 3188.08 | 1.253 |
| 3197.74 | 1.263 |
| 3207.4 | 1.265 |
| 3217.06 | 1.287 |
| 3226.72 | 1.298 |
| 3236.38 | 1.308 |
| 3246.04 | 1.321 |
| 3255.7 | 1.341 |
| 3265.36 | 1.356 |
| 3275.02 | 1.372 |
| 3284.69 | 1.381 |
| 3294.35 | 1.4 |
| 3304.01 | 1.416 |
| 3313.67 | 1.427 |
| 3323.33 | 1.447 |
| 3332.99 | 1.469 |
| 3342.65 | 1.483 |
| 3352.31 | 1.503 |
| 3361.97 | 1.522 |
| 3371.63 | 1.551 |
| 3381.29 | 1.568 |
| 3390.95 | 1.57 |
| 3400.62 | 1.594 |
| 3410.28 | 1.618 |
| 3419.94 | 1.634 |
| 3429.6 | 1.643 |
| 3439.26 | 1.672 |
| 3448.92 | 1.697 |
| 3458.58 | 1.72 |
| 3468.24 | 1.743 |
| 3477.9 | 1.764 |
| 3487.56 | 1.786 |
| 3497.22 | 1.806 |
| 3506.88 | 1.83 |
| 3516.55 | 1.851 |
| 3526.21 | 1.874 |
| 3535.87 | 1.907 |
| 3545.53 | 1.93 |
| 3555.19 | 1.957 |
| 3564.85 | 1.982 |
| 3574.51 | 2.008 |
| 3584.17 | 2.032 |
| 3593.83 | 2.066 |
| 3603.49 | 2.088 |
| 3613.15 | 2.116 |
| 3622.81 | 2.14 |
| 3632.48 | 2.166 |
| 3642.14 | 2.192 |
| 3651.8 | 2.22 |
| 3661.46 | 2.248 |
| 3671.12 | 2.277 |
| 3680.78 | 2.306 |
| 3690.44 | 2.33 |
| 3700.1 | 2.357 |
| 3709.76 | 2.39 |
| 3719.42 | 2.411 |
| 3729.08 | 2.433 |
| 3738.74 | 2.464 |
| 3748.41 | 2.494 |
| 3758.07 | 2.523 |
| 3767.73 | 2.551 |
| 3777.39 | 2.579 |
| 3787.05 | 2.605 |
| 3796.71 | 2.636 |
| 3806.37 | 2.663 |
| 3816.03 | 2.693 |
| 3825.69 | 2.723 |
| 3835.35 | 2.748 |
| 3845.01 | 2.777 |
| 3854.67 | 2.807 |
| 3864.34 | 2.834 |
| 3874.0 | 2.865 |
| 3883.66 | 2.896 |
| 3893.32 | 2.925 |
| 3902.98 | 2.952 |
| 3912.64 | 2.983 |
| 3922.3 | 3.007 |
| 3931.96 | 3.041 |
| 3941.62 | 3.069 |
| 3951.28 | 3.095 |
| 3960.94 | 3.125 |
| 3970.61 | 3.156 |
| 3980.27 | 3.183 |
| 3989.93 | 3.21 |
| 3999.59 | 3.239 |
| 4009.25 | 3.269 |
| 4018.91 | 3.296 |
| 4028.57 | 3.324 |
| 4038.23 | 3.351 |
| 4047.89 | 3.378 |
| 4057.55 | 3.409 |
| 4067.21 | 3.437 |
| 4076.87 | 3.465 |
| 4086.54 | 3.491 |
| 4096.2 | 3.519 |
| 4105.86 | 3.552 |
| 4115.52 | 3.581 |
| 4125.18 | 3.608 |
| 4134.84 | 3.638 |
| 4144.5 | 3.668 |
| 4154.16 | 3.695 |
| 4163.82 | 3.724 |
| 4173.48 | 3.754 |
| 4183.14 | 3.788 |
| 4192.8 | 3.815 |
| 4202.47 | 3.839 |
| 4212.13 | 3.863 |
| 4221.79 | 3.905 |
| 4231.45 | 3.95 |
| 4241.11 | 3.979 |
| 4250.77 | 3.997 |
| 4260.43 | 4.024 |
| 4270.09 | 4.05 |
| 4279.75 | 4.07 |
| 4289.41 | 4.1 |
| 4299.07 | 4.126 |
| 4308.73 | 4.154 |
| 4318.4 | 4.178 |
| 4328.06 | 4.215 |
| 4337.72 | 4.248 |
| 4347.38 | 4.272 |
| 4357.04 | 4.295 |
| 4366.7 | 4.326 |
| 4376.36 | 4.353 |
| 4386.02 | 4.381 |
| 4395.68 | 4.411 |
| 4405.34 | 4.439 |
| 4415.0 | 4.469 |
| 4424.66 | 4.5 |
| 4434.33 | 4.525 |
| 4443.99 | 4.546 |
| 4453.65 | 4.574 |
| 4463.31 | 4.603 |
| 4472.97 | 4.631 |
| 4482.63 | 4.657 |
| 4492.29 | 4.686 |
| 4501.95 | 4.714 |
| 4511.61 | 4.74 |
| 4521.27 | 4.769 |
| 4530.93 | 4.794 |
| 4540.59 | 4.824 |
| 4550.26 | 4.85 |
| 4559.92 | 4.875 |
| 4569.58 | 4.904 |
| 4579.24 | 4.934 |
| 4588.9 | 4.961 |
| 4598.56 | 4.984 |
| 4608.22 | 5.012 |
| 4617.88 | 5.038 |
| 4627.54 | 5.065 |
| 4637.2 | 5.096 |
| 4646.86 | 5.12 |
| 4656.52 | 5.144 |
| 4666.19 | 5.17 |
| 4675.85 | 5.198 |
| 4685.51 | 5.227 |
| 4695.17 | 5.254 |
| 4704.83 | 5.281 |
| 4714.49 | 5.309 |
| 4724.15 | 5.335 |
| 4733.81 | 5.36 |
| 4743.47 | 5.384 |
| 4753.13 | 5.408 |
| 4762.79 | 5.437 |
| 4772.45 | 5.465 |
| 4782.12 | 5.495 |
| 4791.78 | 5.518 |
| 4801.44 | 5.543 |
| 4811.1 | 5.569 |
| 4820.76 | 5.591 |
| 4830.42 | 5.614 |
| 4840.08 | 5.641 |
| 4849.74 | 5.668 |
| 4859.4 | 5.693 |
| 4869.06 | 5.719 |
| 4878.72 | 5.743 |
| 4888.38 | 5.769 |
| 4898.05 | 5.794 |
| 4907.71 | 5.816 |
| 4917.37 | 5.841 |
| 4927.03 | 5.868 |
| 4936.69 | 5.891 |
| 4946.35 | 5.915 |
| 4956.01 | 5.938 |
| 4965.67 | 5.961 |
| 4975.33 | 5.987 |
| 4984.99 | 6.017 |
| 4994.65 | 6.041 |
| 5004.31 | 6.063 |
| 5013.98 | 6.085 |
| 5023.64 | 6.111 |
| 5033.3 | 6.133 |
| 5042.96 | 6.158 |
| 5052.62 | 6.184 |
| 5062.28 | 6.21 |
| 5071.94 | 6.232 |
| 5081.6 | 6.252 |
| 5091.26 | 6.276 |
| 5100.92 | 6.301 |
| 5110.58 | 6.326 |
| 5120.24 | 6.349 |
| 5129.91 | 6.375 |
| 5139.57 | 6.4 |
| 5149.23 | 6.424 |
| 5158.89 | 6.445 |
| 5168.55 | 6.469 |
| 5178.21 | 6.492 |
| 5187.87 | 6.517 |
| 5197.53 | 6.543 |
| 5207.19 | 6.567 |
| 5216.85 | 6.592 |
| 5226.51 | 6.616 |
| 5236.17 | 6.64 |
| 5245.84 | 6.663 |
| 5255.5 | 6.686 |
| 5265.16 | 6.707 |
| 5274.82 | 6.73 |
| 5284.48 | 6.752 |
| 5294.14 | 6.775 |
| 5303.8 | 6.799 |
| 5313.46 | 6.821 |
| 5323.12 | 6.845 |
| 5332.78 | 6.869 |
| 5342.44 | 6.892 |
| 5352.11 | 6.915 |
| 5361.77 | 6.938 |
| 5371.43 | 6.957 |
| 5381.09 | 6.977 |
| 5390.75 | 7.001 |
| 5400.41 | 7.023 |
| 5410.07 | 7.041 |
| 5419.73 | 7.063 |
| 5429.39 | 7.088 |
| 5439.05 | 7.107 |
| 5448.71 | 7.126 |
| 5458.37 | 7.147 |
| 5468.04 | 7.169 |
| 5477.7 | 7.191 |
| 5487.36 | 7.215 |
| 5497.02 | 7.237 |
| 5506.68 | 7.259 |
| 5516.34 | 7.278 |
| 5526.0 | 7.299 |
| 5535.66 | 7.32 |
| 5545.32 | 7.34 |
| 5554.98 | 7.361 |
| 5564.64 | 7.381 |
| 5574.3 | 7.4 |
| 5583.97 | 7.425 |
| 5593.63 | 7.446 |
| 5603.29 | 7.462 |
| 5612.95 | 7.483 |
| 5622.61 | 7.507 |
| 5632.27 | 7.526 |
| 5641.93 | 7.546 |
| 5651.59 | 7.571 |
| 5661.25 | 7.594 |
| 5670.91 | 7.613 |
| 5680.57 | 7.633 |
| 5690.23 | 7.652 |
| 5699.9 | 7.673 |
| 5709.56 | 7.697 |
| 5719.22 | 7.721 |
| 5728.88 | 7.74 |
| 5738.54 | 7.759 |
| 5748.2 | 7.78 |
| 5757.86 | 7.797 |
| 5767.52 | 7.813 |
| 5777.18 | 7.835 |
| 5786.84 | 7.856 |
| 5796.5 | 7.875 |
| 5806.16 | 7.895 |
| 5815.83 | 7.917 |
| 5825.49 | 7.946 |
| 5835.15 | 7.973 |
| 5844.81 | 7.996 |
| 5854.47 | 8.016 |
| 5864.13 | 8.037 |
| 5873.79 | 8.058 |
| 5883.45 | 8.084 |
| 5893.11 | 8.115 |
| 5902.77 | 8.14 |
| 5912.43 | 8.159 |
| 5922.09 | 8.177 |
| 5931.76 | 8.196 |
| 5941.42 | 8.227 |
| 5951.08 | 8.255 |
| 5960.74 | 8.275 |
| 5970.4 | 8.297 |
| 5980.06 | 8.318 |
| 5989.72 | 8.339 |
| 5999.38 | 8.361 |
| 6009.04 | 8.378 |
| 6018.7 | 8.398 |
| 6028.36 | 8.416 |
| 6038.02 | 8.428 |
| 6047.69 | 8.445 |
| 6057.35 | 8.465 |
| 6067.01 | 8.474 |
| 6076.67 | 8.483 |
| 6086.33 | 8.491 |
| 6095.99 | 8.499 |
| 6105.65 | 8.508 |
| 6115.31 | 8.518 |
| 6124.97 | 8.524 |
| 6134.63 | 8.528 |
| 6144.29 | 8.534 |
| 6153.95 | 8.543 |
| 6163.62 | 8.551 |
| 6173.28 | 8.558 |
| 6182.94 | 8.567 |
| 6192.6 | 8.578 |
| 6202.26 | 8.587 |
| 6211.92 | 8.595 |
| 6221.58 | 8.607 |
| 6231.24 | 8.621 |
| 6240.9 | 8.633 |
| 6250.56 | 8.643 |
| 6260.22 | 8.654 |
| 6269.88 | 8.668 |
| 6279.55 | 8.683 |
| 6289.21 | 8.697 |
| 6298.87 | 8.709 |
| 6308.53 | 8.721 |
| 6318.19 | 8.734 |
| 6327.85 | 8.747 |
| 6337.51 | 8.761 |
| 6347.17 | 8.779 |
| 6356.83 | 8.794 |
| 6366.49 | 8.805 |
| 6376.15 | 8.819 |
| 6385.81 | 8.833 |
| 6395.48 | 8.845 |
| 6405.14 | 8.858 |
| 6414.8 | 8.876 |
| 6424.46 | 8.892 |
| 6434.12 | 8.902 |
| 6443.78 | 8.915 |
| 6453.44 | 8.93 |
| 6463.1 | 8.943 |
| 6472.76 | 8.953 |
| 6482.42 | 8.965 |
| 6492.08 | 8.982 |
| 6501.74 | 9.001 |
| 6511.41 | 9.016 |
| 6521.07 | 9.028 |
| 6530.73 | 9.04 |
| 6540.39 | 9.049 |
| 6550.05 | 9.059 |
| 6559.71 | 9.072 |
| 6569.37 | 9.09 |
| 6579.03 | 9.112 |
| 6588.69 | 9.132 |
| 6598.35 | 9.148 |
| 6608.01 | 9.159 |
| 6617.68 | 9.165 |
| 6627.34 | 9.174 |
| 6637.0 | 9.194 |
| 6646.66 | 9.215 |
| 6656.32 | 9.226 |
| 6665.98 | 9.236 |
| 6675.64 | 9.249 |
| 6685.3 | 9.265 |
| 6694.96 | 9.28 |
| 6704.62 | 9.295 |
| 6714.28 | 9.311 |
| 6723.94 | 9.328 |
| 6733.61 | 9.342 |
| 6743.27 | 9.356 |
| 6752.93 | 9.37 |
| 6762.59 | 9.382 |
| 6772.25 | 9.395 |
| 6781.91 | 9.409 |
| 6791.57 | 9.426 |
| 6801.23 | 9.441 |
| 6810.89 | 9.453 |
| 6820.55 | 9.465 |
| 6830.21 | 9.477 |
| 6839.87 | 9.488 |
| 6849.54 | 9.496 |
| 6859.2 | 9.509 |
| 6868.86 | 9.528 |
| 6878.52 | 9.544 |
| 6888.18 | 9.556 |
| 6897.84 | 9.569 |
| 6907.5 | 9.584 |
| 6917.16 | 9.598 |
| 6926.82 | 9.607 |
| 6936.48 | 9.615 |
| 6946.14 | 9.624 |
| 6955.8 | 9.639 |
| 6965.47 | 9.657 |
| 6975.13 | 9.673 |
| 6984.79 | 9.685 |
| 6994.45 | 9.697 |
| 7004.11 | 9.709 |
| 7013.77 | 9.719 |
| 7023.43 | 9.728 |
| 7033.09 | 9.736 |
| 7042.75 | 9.747 |
| 7052.41 | 9.76 |
| 7062.07 | 9.771 |
| 7071.73 | 9.78 |
| 7081.4 | 9.791 |
| 7091.06 | 9.804 |
| 7100.72 | 9.818 |
| 7110.38 | 9.832 |
| 7120.04 | 9.844 |
| 7129.7 | 9.854 |
| 7139.36 | 9.864 |
| 7149.02 | 9.873 |
| 7158.68 | 9.882 |
| 7168.34 | 9.894 |
| 7178.0 | 9.907 |
| 7187.66 | 9.92 |
| 7197.33 | 9.931 |
| 7206.99 | 9.943 |
| 7216.65 | 9.955 |
| 7226.31 | 9.966 |
| 7235.97 | 9.976 |
| 7245.63 | 9.985 |
| 7255.29 | 9.995 |
| 7264.95 | 10.006 |
| 7274.61 | 10.016 |
| 7284.27 | 10.026 |
| 7293.93 | 10.033 |
| 7303.59 | 10.041 |
| 7313.26 | 10.05 |
| 7322.92 | 10.06 |
| 7332.58 | 10.071 |
| 7342.24 | 10.083 |
| 7351.9 | 10.095 |
| 7361.56 | 10.106 |
| 7371.22 | 10.115 |
| 7380.88 | 10.124 |
| 7390.54 | 10.133 |
| 7400.2 | 10.143 |
| 7409.86 | 10.152 |
| 7419.52 | 10.161 |
| 7429.19 | 10.17 |
| 7438.85 | 10.179 |
| 7448.51 | 10.188 |
| 7458.17 | 10.198 |
| 7467.83 | 10.212 |
| 7477.49 | 10.226 |
| 7487.15 | 10.239 |
| 7496.81 | 10.25 |
| 7506.47 | 10.259 |
| 7516.13 | 10.266 |
| 7525.79 | 10.275 |
| 7535.45 | 10.285 |
| 7545.12 | 10.295 |
| 7554.78 | 10.305 |
| 7564.44 | 10.315 |
| 7574.1 | 10.325 |
| 7583.76 | 10.335 |
| 7593.42 | 10.347 |
| 7603.08 | 10.359 |
| 7612.74 | 10.37 |
| 7622.4 | 10.381 |
| 7632.06 | 10.391 |
| 7641.72 | 10.401 |
| 7651.38 | 10.411 |
| 7661.05 | 10.42 |
| 7670.71 | 10.429 |
| 7680.37 | 10.44 |
| 7690.03 | 10.452 |
| 7699.69 | 10.464 |
| 7709.35 | 10.475 |
| 7719.01 | 10.483 |
| 7728.67 | 10.489 |
| 7738.33 | 10.497 |
| 7747.99 | 10.506 |
| 7757.65 | 10.516 |
| 7767.31 | 10.526 |
| 7776.98 | 10.536 |
| 7786.64 | 10.547 |
| 7796.3 | 10.557 |
| 7805.96 | 10.568 |
| 7815.62 | 10.578 |
| 7825.28 | 10.588 |
| 7834.94 | 10.596 |
| 7844.6 | 10.603 |
| 7854.26 | 10.612 |
| 7863.92 | 10.621 |
| 7873.58 | 10.631 |
| 7883.24 | 10.642 |
| 7892.91 | 10.651 |
| 7902.57 | 10.659 |
| 7912.23 | 10.668 |
| 7921.89 | 10.677 |
| 7931.55 | 10.686 |
| 7941.21 | 10.694 |
| 7950.87 | 10.702 |
| 7960.53 | 10.71 |
| 7970.19 | 10.719 |
| 7979.85 | 10.728 |
| 7989.51 | 10.737 |
| 7999.18 | 10.745 |
| 8008.84 | 10.752 |
| 8018.5 | 10.759 |
| 8028.16 | 10.766 |
| 8037.82 | 10.774 |
| 8047.48 | 10.782 |
| 8057.14 | 10.792 |
| 8066.8 | 10.802 |
| 8076.46 | 10.812 |
| 8086.12 | 10.822 |
| 8095.78 | 10.832 |
| 8105.44 | 10.84 |
| 8115.11 | 10.847 |
| 8124.77 | 10.853 |
| 8134.43 | 10.86 |
| 8144.09 | 10.868 |
| 8153.75 | 10.876 |
| 8163.41 | 10.885 |
| 8173.07 | 10.892 |
| 8182.73 | 10.899 |
| 8192.39 | 10.905 |
| 8202.05 | 10.913 |
| 8211.71 | 10.923 |
| 8221.37 | 10.933 |
| 8231.04 | 10.943 |
| 8240.7 | 10.951 |
| 8250.36 | 10.959 |
| 8260.02 | 10.967 |
| 8269.68 | 10.975 |
| 8279.34 | 10.983 |
| 8289.0 | 10.99 |
| 8298.66 | 10.997 |
| 8308.32 | 11.004 |
| 8317.98 | 11.013 |
| 8327.64 | 11.022 |
| 8337.3 | 11.03 |
| 8346.97 | 11.038 |
| 8356.63 | 11.045 |
| 8366.29 | 11.051 |
| 8375.95 | 11.058 |
| 8385.61 | 11.066 |
| 8395.27 | 11.074 |
| 8404.93 | 11.083 |
| 8414.59 | 11.091 |
| 8424.25 | 11.099 |
| 8433.91 | 11.106 |
| 8443.57 | 11.113 |
| 8453.23 | 11.12 |
| 8462.9 | 11.128 |
| 8472.56 | 11.136 |
| 8482.22 | 11.144 |
| 8491.88 | 11.15 |
| 8501.54 | 11.156 |
| 8511.2 | 11.161 |
| 8520.86 | 11.168 |
| 8530.52 | 11.174 |
| 8540.18 | 11.182 |
| 8549.84 | 11.191 |
| 8559.5 | 11.198 |
| 8569.16 | 11.205 |
| 8578.83 | 11.212 |
| 8588.49 | 11.218 |
| 8598.15 | 11.224 |
| 8607.81 | 11.231 |
| 8617.47 | 11.239 |
| 8627.13 | 11.247 |
| 8636.79 | 11.255 |
| 8646.45 | 11.263 |
| 8656.11 | 11.27 |
| 8665.77 | 11.277 |
| 8675.43 | 11.283 |
| 8685.09 | 11.289 |
| 8694.76 | 11.295 |
| 8704.42 | 11.3 |
| 8714.08 | 11.306 |
| 8723.74 | 11.312 |
| 8733.4 | 11.317 |
| 8743.06 | 11.323 |
| 8752.72 | 11.33 |
| 8762.38 | 11.336 |
| 8772.04 | 11.343 |
| 8781.7 | 11.35 |
| 8791.36 | 11.358 |
| 8801.02 | 11.365 |
| 8810.69 | 11.372 |
| 8820.35 | 11.379 |
| 8830.01 | 11.387 |
| 8839.67 | 11.394 |
| 8849.33 | 11.401 |
| 8858.99 | 11.406 |
| 8868.65 | 11.412 |
| 8878.31 | 11.418 |
| 8887.97 | 11.425 |
| 8897.63 | 11.432 |
| 8907.29 | 11.438 |
| 8916.95 | 11.444 |
| 8926.62 | 11.449 |
| 8936.28 | 11.455 |
| 8945.94 | 11.462 |
| 8955.6 | 11.469 |
| 8965.26 | 11.476 |
| 8974.92 | 11.483 |
| 8984.58 | 11.49 |
| 8994.24 | 11.496 |
| 9003.9 | 11.503 |
| 9013.56 | 11.508 |
| 9023.22 | 11.514 |
| 9032.88 | 11.518 |
| 9042.55 | 11.522 |
| 9052.21 | 11.526 |
| 9061.87 | 11.53 |
| 9071.53 | 11.535 |
| 9081.19 | 11.541 |
| 9090.85 | 11.55 |
| 9100.51 | 11.559 |
| 9110.17 | 11.569 |
| 9119.83 | 11.578 |
| 9129.49 | 11.587 |
| 9139.15 | 11.593 |
| 9148.81 | 11.599 |
| 9158.48 | 11.604 |
| 9168.14 | 11.609 |
| 9177.8 | 11.613 |
| 9187.46 | 11.616 |
| 9197.12 | 11.619 |
| 9206.78 | 11.622 |
| 9216.44 | 11.628 |
| 9226.1 | 11.635 |
| 9235.76 | 11.645 |
| 9245.42 | 11.655 |
| 9255.08 | 11.664 |
| 9264.75 | 11.672 |
| 9274.41 | 11.679 |
| 9284.07 | 11.685 |
| 9293.73 | 11.691 |
| 9303.39 | 11.697 |
| 9313.05 | 11.702 |
| 9322.71 | 11.707 |
| 9332.37 | 11.711 |
| 9342.03 | 11.714 |
| 9351.69 | 11.718 |
| 9361.35 | 11.722 |
| 9371.01 | 11.726 |
| 9380.68 | 11.731 |
| 9390.34 | 11.736 |
| 9400.0 | 11.742 |
| 9409.66 | 11.747 |
| 9419.32 | 11.754 |
| 9428.98 | 11.76 |
| 9438.64 | 11.768 |
| 9448.3 | 11.776 |
| 9457.96 | 11.784 |
| 9467.62 | 11.792 |
| 9477.28 | 11.799 |
| 9486.94 | 11.805 |
| 9496.61 | 11.811 |
| 9506.27 | 11.816 |
| 9515.93 | 11.821 |
| 9525.59 | 11.826 |
| 9535.25 | 11.832 |
| 9544.91 | 11.838 |
| 9554.57 | 11.845 |
| 9564.23 | 11.853 |
| 9573.89 | 11.859 |
| 9583.55 | 11.865 |
| 9593.21 | 11.871 |
| 9602.87 | 11.876 |
| 9612.54 | 11.882 |
| 9622.2 | 11.887 |
| 9631.86 | 11.893 |
| 9641.52 | 11.898 |
| 9651.18 | 11.903 |
| 9660.84 | 11.908 |
| 9670.5 | 11.912 |
| 9680.16 | 11.918 |
| 9689.82 | 11.923 |
| 9699.48 | 11.929 |
| 9709.14 | 11.934 |
| 9718.8 | 11.939 |
| 9728.47 | 11.944 |
| 9738.13 | 11.95 |
| 9747.79 | 11.956 |
| 9757.45 | 11.963 |
| 9767.11 | 11.97 |
| 9776.77 | 11.977 |
| 9786.43 | 11.983 |
| 9796.09 | 11.989 |
| 9805.75 | 11.995 |
| 9815.41 | 12 |
| 9825.07 | 12.006 |
| 9834.73 | 12.011 |
| 9844.4 | 12.016 |
| 9854.06 | 12.021 |
| 9863.72 | 12.026 |
| 9873.38 | 12.03 |
| 9883.04 | 12.034 |
| 9892.7 | 12.038 |
| 9902.36 | 12.042 |
| 9912.02 | 12.047 |
| 9921.68 | 12.053 |
| 9931.34 | 12.06 |
| 9941.0 | 12.068 |
| 9950.66 | 12.076 |
| 9960.33 | 12.083 |
| 9969.99 | 12.089 |
| 9979.65 | 12.094 |
| 9989.31 | 12.097 |
| 9998.97 | 12.1 |
| 10008.6 | 12.103 |
| 10018.3 | 12.106 |
| 10028.0 | 12.11 |
| 10037.6 | 12.114 |
| 10047.3 | 12.118 |
| 10056.9 | 12.123 |
| 10066.6 | 12.129 |
| 10076.3 | 12.134 |
| 10085.9 | 12.139 |
| 10095.6 | 12.145 |
| 10105.2 | 12.152 |
| 10114.9 | 12.159 |
| 10124.6 | 12.166 |
| 10134.2 | 12.174 |
| 10143.9 | 12.181 |
| 10153.5 | 12.187 |
| 10163.2 | 12.192 |
| 10172.9 | 12.197 |
| 10182.5 | 12.202 |
| 10192.2 | 12.207 |
| 10201.8 | 12.213 |
| 10211.5 | 12.218 |
| 10221.2 | 12.223 |
| 10230.8 | 12.228 |
| 10240.5 | 12.232 |
| 10250.2 | 12.237 |
| 10259.8 | 12.242 |
| 10269.5 | 12.247 |
| 10279.1 | 12.252 |
| 10288.8 | 12.258 |
| 10298.5 | 12.264 |
| 10308.1 | 12.27 |
| 10317.8 | 12.275 |
| 10327.4 | 12.281 |
| 10337.1 | 12.286 |
| 10346.8 | 12.29 |
| 10356.4 | 12.296 |
| 10366.1 | 12.302 |
| 10375.7 | 12.308 |
| 10385.4 | 12.316 |
| 10395.1 | 12.323 |
| 10404.7 | 12.33 |
| 10414.4 | 12.336 |
| 10424.0 | 12.34 |
| 10433.7 | 12.344 |
| 10443.4 | 12.346 |
| 10453.0 | 12.348 |
| 10462.7 | 12.351 |
| 10472.3 | 12.354 |
| 10482.0 | 12.358 |
| 10491.7 | 12.363 |
| 10501.3 | 12.368 |
| 10511.0 | 12.372 |
| 10520.7 | 12.378 |
| 10530.3 | 12.384 |
| 10540.0 | 12.39 |
| 10549.6 | 12.397 |
| 10559.3 | 12.405 |
| 10569.0 | 12.411 |
| 10578.6 | 12.418 |
| 10588.3 | 12.423 |
| 10597.9 | 12.427 |
| 10607.6 | 12.431 |
| 10617.3 | 12.433 |
| 10626.9 | 12.435 |
| 10636.6 | 12.438 |
| 10646.2 | 12.441 |
| 10655.9 | 12.447 |
| 10665.6 | 12.453 |
| 10675.2 | 12.459 |
| 10684.9 | 12.465 |
| 10694.5 | 12.471 |
| 10704.2 | 12.475 |
| 10713.9 | 12.479 |
| 10723.5 | 12.481 |
| 10733.2 | 12.482 |
| 10742.9 | 12.484 |
| 10752.5 | 12.486 |
| 10762.2 | 12.488 |
| 10771.8 | 12.492 |
| 10781.5 | 12.496 |
| 10791.2 | 12.501 |
| 10800.8 | 12.506 |
| 10810.5 | 12.513 |
| 10820.1 | 12.519 |
| 10829.8 | 12.526 |
| 10839.5 | 12.533 |
| 10849.1 | 12.54 |
| 10858.8 | 12.547 |
| 10868.4 | 12.554 |
| 10878.1 | 12.562 |
| 10887.8 | 12.569 |
| 10897.4 | 12.576 |
| 10907.1 | 12.581 |
| 10916.7 | 12.587 |
| 10926.4 | 12.591 |
| 10936.1 | 12.595 |
| 10945.7 | 12.598 |
| 10955.4 | 12.6 |
| 10965.1 | 12.602 |
| 10974.7 | 12.604 |
| 10984.4 | 12.605 |
| 10994.0 | 12.606 |
| 11003.7 | 12.608 |
| 11013.4 | 12.61 |
| 11023.0 | 12.613 |
| 11032.7 | 12.617 |
| 11042.3 | 12.623 |
| 11052.0 | 12.629 |
| 11061.7 | 12.635 |
| 11071.3 | 12.642 |
| 11081.0 | 12.648 |
| 11090.6 | 12.654 |
| 11100.3 | 12.659 |
| 11110.0 | 12.664 |
| 11119.6 | 12.668 |
| 11129.3 | 12.671 |
| 11138.9 | 12.674 |
| 11148.6 | 12.676 |
| 11158.3 | 12.679 |
| 11167.9 | 12.682 |
| 11177.6 | 12.685 |
| 11187.3 | 12.69 |
| 11196.9 | 12.696 |
| 11206.6 | 12.703 |
| 11216.2 | 12.71 |
| 11225.9 | 12.717 |
| 11235.6 | 12.723 |
| 11245.2 | 12.729 |
| 11254.9 | 12.732 |
| 11264.5 | 12.733 |
| 11274.2 | 12.735 |
| 11283.9 | 12.734 |
| 11293.5 | 12.734 |
| 11303.2 | 12.735 |
| 11312.8 | 12.736 |
| 11322.5 | 12.737 |
| 11332.2 | 12.741 |
| 11341.8 | 12.744 |
| 11351.5 | 12.748 |
| 11361.1 | 12.752 |
| 11370.8 | 12.757 |
| 11380.5 | 12.762 |
| 11390.1 | 12.766 |
| 11399.8 | 12.771 |
| 11409.5 | 12.776 |
| 11419.1 | 12.781 |
| 11428.8 | 12.785 |
| 11438.4 | 12.79 |
| 11448.1 | 12.795 |
| 11457.8 | 12.799 |
| 11467.4 | 12.803 |
| 11477.1 | 12.807 |
| 11486.7 | 12.811 |
| 11496.4 | 12.815 |
| 11506.1 | 12.819 |
| 11515.7 | 12.822 |
| 11525.4 | 12.825 |
| 11535.0 | 12.828 |
| 11544.7 | 12.83 |
| 11554.4 | 12.833 |
| 11564.0 | 12.835 |
| 11573.7 | 12.837 |
| 11583.3 | 12.84 |
| 11593.0 | 12.843 |
| 11602.7 | 12.847 |
| 11612.3 | 12.851 |
| 11622.0 | 12.856 |
| 11631.7 | 12.861 |
| 11641.3 | 12.865 |
| 11651.0 | 12.87 |
| 11660.6 | 12.874 |
| 11670.3 | 12.878 |
| 11680.0 | 12.882 |
| 11689.6 | 12.884 |
| 11699.3 | 12.887 |
| 11708.9 | 12.89 |
| 11718.6 | 12.893 |
| 11728.3 | 12.896 |
| 11737.9 | 12.899 |
| 11747.6 | 12.903 |
| 11757.2 | 12.907 |
| 11766.9 | 12.91 |
| 11776.6 | 12.913 |
| 11786.2 | 12.916 |
| 11795.9 | 12.919 |
| 11805.5 | 12.922 |
| 11815.2 | 12.926 |
| 11824.9 | 12.929 |
| 11834.5 | 12.933 |
| 11844.2 | 12.936 |
| 11853.8 | 12.94 |
| 11863.5 | 12.943 |
| 11873.2 | 12.945 |
| 11882.8 | 12.948 |
| 11892.5 | 12.95 |
| 11902.2 | 12.952 |
| 11911.8 | 12.954 |
| 11921.5 | 12.956 |
| 11931.1 | 12.958 |
| 11940.8 | 12.96 |
| 11950.5 | 12.961 |
| 11960.1 | 12.963 |
| 11969.8 | 12.964 |
| 11979.4 | 12.965 |
| 11989.1 | 12.965 |
| 11998.8 | 12.966 |
| 12008.4 | 12.967 |
| 12018.1 | 12.967 |
| 12027.7 | 12.967 |
| 12037.4 | 12.966 |
| 12047.1 | 12.966 |
| 12056.7 | 12.966 |
| 12066.4 | 12.967 |
| 12076.0 | 12.967 |
| 12085.7 | 12.968 |
| 12095.4 | 12.97 |
| 12105.0 | 12.972 |
| 12114.7 | 12.974 |
| 12124.4 | 12.978 |
| 12134.0 | 12.981 |
| 12143.7 | 12.985 |
| 12153.3 | 12.989 |
| 12163.0 | 12.994 |
| 12172.7 | 12.998 |
| 12182.3 | 13.002 |
| 12192.0 | 13.006 |
| 12201.6 | 13.01 |
| 12211.3 | 13.013 |
| 12221.0 | 13.015 |
| 12230.6 | 13.017 |
| 12240.3 | 13.019 |
| 12249.9 | 13.02 |
| 12259.6 | 13.021 |
| 12269.3 | 13.023 |
| 12278.9 | 13.024 |
| 12288.6 | 13.026 |
| 12298.2 | 13.027 |
| 12307.9 | 13.029 |
| 12317.6 | 13.03 |
| 12327.2 | 13.033 |
| 12336.9 | 13.035 |
| 12346.6 | 13.038 |
| 12356.2 | 13.042 |
| 12365.9 | 13.046 |
| 12375.5 | 13.05 |
| 12385.2 | 13.054 |
| 12394.9 | 13.058 |
| 12404.5 | 13.062 |
| 12414.2 | 13.065 |
| 12423.8 | 13.067 |
| 12433.5 | 13.07 |
| 12443.2 | 13.072 |
| 12452.8 | 13.074 |
| 12462.5 | 13.076 |
| 12472.1 | 13.078 |
| 12481.8 | 13.08 |
| 12491.5 | 13.082 |
| 12501.1 | 13.085 |
| 12510.8 | 13.087 |
| 12520.4 | 13.089 |
| 12530.1 | 13.09 |
| 12539.8 | 13.092 |
| 12549.4 | 13.093 |
| 12559.1 | 13.094 |
| 12568.8 | 13.094 |
| 12578.4 | 13.093 |
| 12588.1 | 13.093 |
| 12597.7 | 13.092 |
| 12607.4 | 13.091 |
| 12617.1 | 13.091 |
| 12626.7 | 13.091 |
| 12636.4 | 13.091 |
| 12646.0 | 13.091 |
| 12655.7 | 13.093 |
| 12665.4 | 13.095 |
| 12675.0 | 13.097 |
| 12684.7 | 13.101 |
| 12694.3 | 13.105 |
| 12704.0 | 13.11 |
| 12713.7 | 13.114 |
| 12723.3 | 13.12 |
| 12733.0 | 13.125 |
| 12742.6 | 13.131 |
| 12752.3 | 13.135 |
| 12762.0 | 13.14 |
| 12771.6 | 13.144 |
| 12781.3 | 13.147 |
| 12791.0 | 13.15 |
| 12800.6 | 13.152 |
| 12810.3 | 13.154 |
| 12819.9 | 13.156 |
| 12829.6 | 13.157 |
| 12839.3 | 13.159 |
| 12848.9 | 13.161 |
| 12858.6 | 13.163 |
| 12868.2 | 13.165 |
| 12877.9 | 13.166 |
| 12887.6 | 13.168 |
| 12897.2 | 13.169 |
| 12906.9 | 13.17 |
| 12916.5 | 13.17 |
| 12926.2 | 13.171 |
| 12935.9 | 13.171 |
| 12945.5 | 13.172 |
| 12955.2 | 13.172 |
| 12964.8 | 13.172 |
| 12974.5 | 13.174 |
| 12984.2 | 13.175 |
| 12993.8 | 13.177 |
| 13003.5 | 13.179 |
| 13013.2 | 13.182 |
| 13022.8 | 13.184 |
| 13032.5 | 13.187 |
| 13042.1 | 13.189 |
| 13051.8 | 13.191 |
| 13061.5 | 13.193 |
| 13071.1 | 13.196 |
| 13080.8 | 13.198 |
| 13090.4 | 13.2 |
| 13100.1 | 13.202 |
| 13109.8 | 13.204 |
| 13119.4 | 13.206 |
| 13129.1 | 13.208 |
| 13138.7 | 13.208 |
| 13148.4 | 13.208 |
| 13158.1 | 13.208 |
| 13167.7 | 13.207 |
| 13177.4 | 13.207 |
| 13187.0 | 13.206 |
| 13196.7 | 13.206 |
| 13206.4 | 13.207 |
| 13216.0 | 13.207 |
| 13225.7 | 13.208 |
| 13235.4 | 13.21 |
| 13245.0 | 13.212 |
| 13254.7 | 13.215 |
| 13264.3 | 13.217 |
| 13274.0 | 13.22 |
| 13283.7 | 13.223 |
| 13293.3 | 13.226 |
| 13303.0 | 13.229 |
| 13312.6 | 13.233 |
| 13322.3 | 13.237 |
| 13332.0 | 13.241 |
| 13341.6 | 13.245 |
| 13351.3 | 13.25 |
| 13360.9 | 13.254 |
| 13370.6 | 13.258 |
| 13380.3 | 13.262 |
| 13389.9 | 13.265 |
| 13399.6 | 13.268 |
| 13409.2 | 13.27 |
| 13418.9 | 13.272 |
| 13428.6 | 13.274 |
| 13438.2 | 13.275 |
| 13447.9 | 13.276 |
| 13457.5 | 13.276 |
| 13467.2 | 13.277 |
| 13476.9 | 13.277 |
| 13486.5 | 13.278 |
| 13496.2 | 13.278 |
| 13505.9 | 13.278 |
| 13515.5 | 13.278 |
| 13525.2 | 13.278 |
| 13534.8 | 13.278 |
| 13544.5 | 13.278 |
| 13554.2 | 13.279 |
| 13563.8 | 13.279 |
| 13573.5 | 13.279 |
| 13583.1 | 13.28 |
| 13592.8 | 13.28 |
| 13602.5 | 13.28 |
| 13612.1 | 13.281 |
| 13621.8 | 13.281 |
| 13631.4 | 13.282 |
| 13641.1 | 13.283 |
| 13650.8 | 13.284 |
| 13660.4 | 13.285 |
| 13670.1 | 13.286 |
| 13679.7 | 13.288 |
| 13689.4 | 13.289 |
| 13699.1 | 13.29 |
| 13708.7 | 13.291 |
| 13718.4 | 13.292 |
| 13728.1 | 13.293 |
| 13737.7 | 13.294 |
| 13747.4 | 13.295 |
| 13757.0 | 13.296 |
| 13766.7 | 13.298 |
| 13776.4 | 13.299 |
| 13786.0 | 13.301 |
| 13795.7 | 13.303 |
| 13805.3 | 13.304 |
| 13815.0 | 13.306 |
| 13824.7 | 13.308 |
| 13834.3 | 13.308 |
| 13844.0 | 13.309 |
| 13853.6 | 13.309 |
| 13863.3 | 13.309 |
| 13873.0 | 13.309 |
| 13882.6 | 13.308 |
| 13892.3 | 13.308 |
| 13901.9 | 13.308 |
| 13911.6 | 13.309 |
| 13921.3 | 13.31 |
| 13930.9 | 13.311 |
| 13940.6 | 13.312 |
| 13950.3 | 13.314 |
| 13959.9 | 13.317 |
| 13969.6 | 13.319 |
| 13979.2 | 13.322 |
| 13988.9 | 13.325 |
| 13998.6 | 13.328 |
| 14008.2 | 13.33 |
| 14017.9 | 13.333 |
| 14027.5 | 13.335 |
| 14037.2 | 13.338 |
| 14046.9 | 13.34 |
| 14056.5 | 13.342 |
| 14066.2 | 13.345 |
| 14075.8 | 13.347 |
| 14085.5 | 13.349 |
| 14095.2 | 13.351 |
| 14104.8 | 13.353 |
| 14114.5 | 13.355 |
| 14124.1 | 13.357 |
| 14133.8 | 13.359 |
| 14143.5 | 13.36 |
| 14153.1 | 13.361 |
| 14162.8 | 13.362 |
| 14172.5 | 13.363 |
| 14182.1 | 13.362 |
| 14191.8 | 13.362 |
| 14201.4 | 13.361 |
| 14211.1 | 13.36 |
| 14220.8 | 13.359 |
| 14230.4 | 13.358 |
| 14240.1 | 13.356 |
| 14249.7 | 13.355 |
| 14259.4 | 13.355 |
| 14269.1 | 13.354 |
| 14278.7 | 13.354 |
| 14288.4 | 13.354 |
| 14298.0 | 13.355 |
| 14307.7 | 13.356 |
| 14317.4 | 13.357 |
| 14327.0 | 13.358 |
| 14336.7 | 13.359 |
| 14346.3 | 13.36 |
| 14356.0 | 13.362 |
| 14365.7 | 13.363 |
| 14375.3 | 13.363 |
| 14385.0 | 13.364 |
| 14394.7 | 13.365 |
| 14404.3 | 13.366 |
| 14414.0 | 13.367 |
| 14423.6 | 13.369 |
| 14433.3 | 13.37 |
| 14443.0 | 13.371 |
| 14452.6 | 13.373 |
| 14462.3 | 13.376 |
| 14471.9 | 13.378 |
| 14481.6 | 13.38 |
| 14491.3 | 13.382 |
| 14500.9 | 13.383 |
| 14510.6 | 13.385 |
| 14520.2 | 13.387 |
| 14529.9 | 13.388 |
| 14539.6 | 13.388 |
| 14549.2 | 13.389 |
| 14558.9 | 13.39 |
| 14568.5 | 13.39 |
| 14578.2 | 13.391 |
| 14587.9 | 13.391 |
| 14597.5 | 13.391 |
| 14607.2 | 13.392 |
| 14616.9 | 13.391 |
| 14626.5 | 13.391 |
| 14636.2 | 13.391 |
| 14645.8 | 13.391 |
| 14655.5 | 13.39 |
| 14665.2 | 13.389 |
| 14674.8 | 13.388 |
| 14684.5 | 13.388 |
| 14694.1 | 13.388 |
| 14703.8 | 13.389 |
| 14713.5 | 13.39 |
| 14723.1 | 13.391 |
| 14732.8 | 13.393 |
| 14742.4 | 13.396 |
| 14752.1 | 13.4 |
| 14761.8 | 13.404 |
| 14771.4 | 13.407 |
| 14781.1 | 13.41 |
| 14790.7 | 13.414 |
| 14800.4 | 13.417 |
| 14810.1 | 13.42 |
| 14819.7 | 13.422 |
| 14829.4 | 13.423 |
| 14839.0 | 13.423 |
| 14848.7 | 13.424 |
| 14858.4 | 13.425 |
| 14868.0 | 13.424 |
| 14877.7 | 13.423 |
| 14887.4 | 13.422 |
| 14897.0 | 13.422 |
| 14906.7 | 13.421 |
| 14916.3 | 13.422 |
| 14926.0 | 13.422 |
| 14935.7 | 13.422 |
| 14945.3 | 13.423 |
| 14955.0 | 13.425 |
| 14964.6 | 13.427 |
| 14974.3 | 13.429 |
| 14984.0 | 13.431 |
| 14993.6 | 13.432 |
| 15003.3 | 13.433 |
| 15012.9 | 13.434 |
| 15022.6 | 13.435 |
| 15032.3 | 13.435 |
| 15041.9 | 13.435 |
| 15051.6 | 13.434 |
| 15061.2 | 13.434 |
| 15070.9 | 13.433 |
| 15080.6 | 13.433 |
| 15090.2 | 13.434 |
| 15099.9 | 13.434 |
| 15109.6 | 13.434 |
| 15119.2 | 13.434 |
| 15128.9 | 13.436 |
| 15138.5 | 13.438 |
| 15148.2 | 13.44 |
| 15157.9 | 13.442 |
| 15167.5 | 13.444 |
| 15177.2 | 13.448 |
| 15186.8 | 13.451 |
| 15196.5 | 13.454 |
| 15206.2 | 13.457 |
| 15215.8 | 13.461 |
| 15225.5 | 13.465 |
| 15235.1 | 13.469 |
| 15244.8 | 13.473 |
| 15254.5 | 13.476 |
| 15264.1 | 13.479 |
| 15273.8 | 13.482 |
| 15283.4 | 13.485 |
| 15293.1 | 13.488 |
| 15302.8 | 13.49 |
| 15312.4 | 13.491 |
| 15322.1 | 13.492 |
| 15331.8 | 13.493 |
| 15341.4 | 13.494 |
| 15351.1 | 13.493 |
| 15360.7 | 13.492 |
| 15370.4 | 13.491 |
| 15380.1 | 13.49 |
| 15389.7 | 13.489 |
| 15399.4 | 13.488 |
| 15409.0 | 13.488 |
| 15418.7 | 13.487 |
| 15428.4 | 13.486 |
| 15438.0 | 13.486 |
| 15447.7 | 13.487 |
| 15457.3 | 13.488 |
| 15467.0 | 13.489 |
| 15476.7 | 13.49 |
| 15486.3 | 13.492 |
| 15496.0 | 13.494 |
| 15505.6 | 13.497 |
| 15515.3 | 13.499 |
| 15525.0 | 13.501 |
| 15534.6 | 13.503 |
| 15544.3 | 13.505 |
| 15554.0 | 13.507 |
| 15563.6 | 13.509 |
| 15573.3 | 13.512 |
| 15582.9 | 13.513 |
| 15592.6 | 13.514 |
| 15602.3 | 13.515 |
| 15611.9 | 13.516 |
| 15621.6 | 13.517 |
| 15631.2 | 13.517 |
| 15640.9 | 13.516 |
| 15650.6 | 13.516 |
| 15660.2 | 13.516 |
| 15669.9 | 13.515 |
| 15679.5 | 13.514 |
| 15689.2 | 13.513 |
| 15698.9 | 13.512 |
| 15708.5 | 13.511 |
| 15718.2 | 13.511 |
| 15727.8 | 13.511 |
| 15737.5 | 13.511 |
| 15747.2 | 13.511 |
| 15756.8 | 13.511 |
| 15766.5 | 13.511 |
| 15776.2 | 13.512 |
| 15785.8 | 13.512 |
| 15795.5 | 13.513 |
| 15805.1 | 13.514 |
| 15814.8 | 13.515 |
| 15824.5 | 13.516 |
| 15834.1 | 13.517 |
| 15843.8 | 13.518 |
| 15853.4 | 13.52 |
| 15863.1 | 13.521 |
| 15872.8 | 13.523 |
| 15882.4 | 13.526 |
| 15892.1 | 13.528 |
| 15901.7 | 13.53 |
| 15911.4 | 13.532 |
| 15921.1 | 13.534 |
| 15930.7 | 13.537 |
| 15940.4 | 13.539 |
| 15950.0 | 13.541 |
| 15959.7 | 13.543 |
| 15969.4 | 13.545 |
| 15979.0 | 13.547 |
| 15988.7 | 13.549 |
| 15998.4 | 13.551 |
| 16008.0 | 13.553 |
| 16017.7 | 13.554 |
| 16027.3 | 13.556 |
| 16037.0 | 13.558 |
| 16046.7 | 13.56 |
| 16056.3 | 13.562 |
| 16066.0 | 13.565 |
| 16075.6 | 13.567 |
| 16085.3 | 13.569 |
| 16095.0 | 13.571 |
| 16104.6 | 13.574 |
| 16114.3 | 13.576 |
| 16123.9 | 13.578 |
| 16133.6 | 13.58 |
| 16143.3 | 13.582 |
| 16152.9 | 13.585 |
| 16162.6 | 13.587 |
| 16172.2 | 13.59 |
| 16181.9 | 13.593 |
| 16191.6 | 13.596 |
| 16201.2 | 13.599 |
| 16210.9 | 13.602 |
| 16220.5 | 13.607 |
| 16230.2 | 13.611 |
| 16239.9 | 13.616 |
| 16249.5 | 13.62 |
| 16259.2 | 13.624 |
| 16268.9 | 13.629 |
| 16278.5 | 13.633 |
| 16288.2 | 13.637 |
| 16297.8 | 13.642 |
| 16307.5 | 13.646 |
| 16317.2 | 13.648 |
| 16326.8 | 13.651 |
| 16336.5 | 13.653 |
| 16346.1 | 13.656 |
| 16355.8 | 13.658 |
| 16365.5 | 13.659 |
| 16375.1 | 13.66 |
| 16384.8 | 13.661 |
| 16394.4 | 13.662 |
| 16404.1 | 13.663 |
| 16413.8 | 13.663 |
| 16423.4 | 13.664 |
| 16433.1 | 13.665 |
| 16442.7 | 13.666 |
| 16452.4 | 13.667 |
| 16462.1 | 13.668 |
| 16471.7 | 13.67 |
| 16481.4 | 13.672 |
| 16491.1 | 13.674 |
| 16500.7 | 13.676 |
| 16510.4 | 13.678 |
| 16520.0 | 13.679 |
| 16529.7 | 13.681 |
| 16539.4 | 13.683 |
| 16549.0 | 13.685 |
| 16558.7 | 13.686 |
| 16568.3 | 13.688 |
| 16578.0 | 13.688 |
| 16587.7 | 13.688 |
| 16597.3 | 13.689 |
| 16607.0 | 13.689 |
| 16616.6 | 13.689 |
| 16626.3 | 13.69 |
| 16636.0 | 13.69 |
| 16645.6 | 13.69 |
| 16655.3 | 13.691 |
| 16664.9 | 13.691 |
| 16674.6 | 13.692 |
| 16684.3 | 13.693 |
| 16693.9 | 13.695 |
| 16703.6 | 13.697 |
| 16713.3 | 13.698 |
| 16722.9 | 13.7 |
| 16732.6 | 13.702 |
| 16742.2 | 13.704 |
| 16751.9 | 13.705 |
| 16761.6 | 13.707 |
| 16771.2 | 13.709 |
| 16780.9 | 13.711 |
| 16790.5 | 13.712 |
| 16800.2 | 13.714 |
| 16809.9 | 13.715 |
| 16819.5 | 13.717 |
| 16829.2 | 13.718 |
| 16838.8 | 13.72 |
| 16848.5 | 13.724 |
| 16858.2 | 13.727 |
| 16867.8 | 13.731 |
| 16877.5 | 13.734 |
| 16887.1 | 13.738 |
| 16896.8 | 13.743 |
| 16906.5 | 13.748 |
| 16916.1 | 13.754 |
| 16925.8 | 13.76 |
| 16935.5 | 13.765 |
| 16945.1 | 13.771 |
| 16954.8 | 13.777 |
| 16964.4 | 13.782 |
| 16974.1 | 13.788 |
| 16983.8 | 13.794 |
| 16993.4 | 13.799 |
| 17003.1 | 13.805 |
| 17012.7 | 13.809 |
| 17022.4 | 13.813 |
| 17032.1 | 13.817 |
| 17041.7 | 13.822 |
| 17051.4 | 13.826 |
| 17061.0 | 13.83 |
| 17070.7 | 13.833 |
| 17080.4 | 13.836 |
| 17090.0 | 13.839 |
| 17099.7 | 13.842 |
| 17109.3 | 13.845 |
| 17119.0 | 13.848 |
| 17128.7 | 13.851 |
| 17138.3 | 13.854 |
| 17148.0 | 13.857 |
| 17157.7 | 13.859 |
| 17167.3 | 13.862 |
| 17177.0 | 13.865 |
| 17186.6 | 13.868 |
| 17196.3 | 13.871 |
| 17206.0 | 13.875 |
| 17215.6 | 13.878 |
| 17225.3 | 13.881 |
| 17234.9 | 13.885 |
| 17244.6 | 13.888 |
| 17254.3 | 13.892 |
| 17263.9 | 13.896 |
| 17273.6 | 13.899 |
| 17283.2 | 13.903 |
| 17292.9 | 13.907 |
| 17302.6 | 13.91 |
| 17312.2 | 13.914 |
| 17321.9 | 13.917 |
| 17331.5 | 13.92 |
| 17341.2 | 13.924 |
| 17350.9 | 13.926 |
| 17360.5 | 13.929 |
| 17370.2 | 13.931 |
| 17379.9 | 13.934 |
| 17389.5 | 13.936 |
| 17399.2 | 13.939 |
| 17408.8 | 13.941 |
| 17418.5 | 13.942 |
| 17428.2 | 13.944 |
| 17437.8 | 13.946 |
| 17447.5 | 13.947 |
| 17457.1 | 13.949 |
| 17466.8 | 13.951 |
| 17476.5 | 13.954 |
| 17486.1 | 13.957 |
| 17495.8 | 13.96 |
| 17505.4 | 13.963 |
| 17515.1 | 13.965 |
| 17524.8 | 13.971 |
| 17534.4 | 13.977 |
| 17544.1 | 13.984 |
| 17553.7 | 13.99 |
| 17563.4 | 13.997 |
| 17573.1 | 14.003 |
| 17582.7 | 14.01 |
| 17592.4 | 14.019 |
| 17602.0 | 14.027 |
| 17611.7 | 14.035 |
| 17621.4 | 14.043 |
| 17631.0 | 14.051 |
| 17640.7 | 14.058 |
| 17650.4 | 14.063 |
| 17660.0 | 14.067 |
| 17669.7 | 14.072 |
| 17679.3 | 14.077 |
| 17689.0 | 14.081 |
| 17698.7 | 14.086 |
| 17708.3 | 14.086 |
| 17718.0 | 14.087 |
| 17727.6 | 14.088 |
| 17737.3 | 14.088 |
| 17747.0 | 14.089 |
| 17756.6 | 14.09 |
| 17766.3 | 14.09 |
| 17775.9 | 14.09 |
| 17785.6 | 14.09 |
| 17795.3 | 14.09 |
| 17804.9 | 14.09 |
| 17814.6 | 14.09 |
| 17824.2 | 14.091 |
| 17833.9 | 14.092 |
| 17843.6 | 14.094 |
| 17853.2 | 14.095 |
| 17862.9 | 14.096 |
| 17872.6 | 14.098 |
| 17882.2 | 14.099 |
| 17891.9 | 14.1 |
| 17901.5 | 14.101 |
| 17911.2 | 14.102 |
| 17920.9 | 14.103 |
| 17930.5 | 14.104 |
| 17940.2 | 14.105 |
| 17949.8 | 14.106 |
| 17959.5 | 14.107 |
| 17969.2 | 14.108 |
| 17978.8 | 14.109 |
| 17988.5 | 14.109 |
| 17998.1 | 14.11 |
| 18007.8 | 14.111 |
| 18017.5 | 14.114 |
| 18027.1 | 14.116 |
| 18036.8 | 14.118 |
| 18046.4 | 14.121 |
| 18056.1 | 14.123 |
| 18065.8 | 14.126 |
| 18075.4 | 14.129 |
| 18085.1 | 14.133 |
| 18094.8 | 14.137 |
| 18104.4 | 14.141 |
| 18114.1 | 14.145 |
| 18123.7 | 14.148 |
| 18133.4 | 14.152 |
| 18143.1 | 14.156 |
| 18152.7 | 14.159 |
| 18162.4 | 14.162 |
| 18172.0 | 14.166 |
| 18181.7 | 14.169 |
| 18191.4 | 14.172 |
| 18201.0 | 14.175 |
| 18210.7 | 14.177 |
| 18220.3 | 14.18 |
| 18230.0 | 14.182 |
| 18239.7 | 14.184 |
| 18249.3 | 14.187 |
| 18259.0 | 14.189 |
| 18268.6 | 14.191 |
| 18278.3 | 14.193 |
| 18288.0 | 14.196 |
| 18297.6 | 14.198 |
| 18307.3 | 14.2 |
| 18317.0 | 14.202 |
| 18326.6 | 14.205 |
| 18336.3 | 14.207 |
| 18345.9 | 14.21 |
| 18355.6 | 14.213 |
| 18365.3 | 14.216 |
| 18374.9 | 14.219 |
| 18384.6 | 14.222 |
| 18394.2 | 14.225 |
| 18403.9 | 14.228 |
| 18413.6 | 14.231 |
| 18423.2 | 14.234 |
| 18432.9 | 14.236 |
| 18442.5 | 14.239 |
| 18452.2 | 14.242 |
| 18461.9 | 14.244 |
| 18471.5 | 14.246 |
| 18481.2 | 14.249 |
| 18490.8 | 14.251 |
| 18500.5 | 14.253 |
| 18510.2 | 14.255 |
| 18519.8 | 14.257 |
| 18529.5 | 14.258 |
| 18539.2 | 14.259 |
| 18548.8 | 14.26 |
| 18558.5 | 14.261 |
| 18568.1 | 14.263 |
| 18577.8 | 14.264 |
| 18587.5 | 14.265 |
| 18597.1 | 14.266 |
| 18606.8 | 14.266 |
| 18616.4 | 14.267 |
| 18626.1 | 14.267 |
| 18635.8 | 14.268 |
| 18645.4 | 14.269 |
| 18655.1 | 14.269 |
| 18664.7 | 14.269 |
| 18674.4 | 14.269 |
| 18684.1 | 14.269 |
| 18693.7 | 14.27 |
| 18703.4 | 14.27 |
| 18713.0 | 14.27 |
| 18722.7 | 14.27 |
| 18732.4 | 14.271 |
| 18742.0 | 14.272 |
| 18751.7 | 14.273 |
| 18761.4 | 14.274 |
| 18771.0 | 14.276 |
| 18780.7 | 14.277 |
| 18790.3 | 14.278 |
| 18800.0 | 14.281 |
| 18809.7 | 14.284 |
| 18819.3 | 14.286 |
| 18829.0 | 14.289 |
| 18838.6 | 14.292 |
| 18848.3 | 14.294 |
| 18858.0 | 14.297 |
| 18867.6 | 14.299 |
| 18877.3 | 14.301 |
| 18886.9 | 14.303 |
| 18896.6 | 14.306 |
| 18906.3 | 14.308 |
| 18915.9 | 14.31 |
| 18925.6 | 14.312 |
| 18935.2 | 14.312 |
| 18944.9 | 14.311 |
| 18954.6 | 14.311 |
| 18964.2 | 14.311 |
| 18973.9 | 14.311 |
| 18983.5 | 14.31 |
| 18993.2 | 14.31 |
| 19002.9 | 14.309 |
| 19012.5 | 14.308 |
| 19022.2 | 14.308 |
| 19031.9 | 14.307 |
| 19041.5 | 14.306 |
| 19051.2 | 14.305 |
| 19060.8 | 14.304 |
| 19070.5 | 14.305 |
| 19080.2 | 14.307 |
| 19089.8 | 14.31 |
| 19099.5 | 14.312 |
| 19109.1 | 14.314 |
| 19118.8 | 14.316 |
| 19128.5 | 14.318 |
| 19138.1 | 14.321 |
| 19147.8 | 14.326 |
| 19157.4 | 14.33 |
| 19167.1 | 14.335 |
| 19176.8 | 14.34 |
| 19186.4 | 14.345 |
| 19196.1 | 14.35 |
| 19205.7 | 14.355 |
| 19215.4 | 14.358 |
| 19225.1 | 14.362 |
| 19234.7 | 14.365 |
| 19244.4 | 14.369 |
| 19254.1 | 14.372 |
| 19263.7 | 14.376 |
| 19273.4 | 14.38 |
| 19283.0 | 14.38 |
| 19292.7 | 14.379 |
| 19302.4 | 14.378 |
| 19312.0 | 14.377 |
| 19321.7 | 14.376 |
| 19331.3 | 14.375 |
| 19341.0 | 14.374 |
| 19350.7 | 14.372 |
| 19360.3 | 14.367 |
| 19370.0 | 14.363 |
| 19379.6 | 14.358 |
| 19389.3 | 14.353 |
| 19399.0 | 14.349 |
| 19408.6 | 14.344 |
| 19418.3 | 14.339 |
| 19427.9 | 14.335 |
| 19437.6 | 14.33 |
| 19447.3 | 14.325 |
| 19456.9 | 14.32 |
| 19466.6 | 14.315 |
| 19476.3 | 14.31 |
| 19485.9 | 14.305 |
| 19495.6 | 14.301 |
| 19505.2 | 14.299 |
| 19514.9 | 14.298 |
| 19524.6 | 14.296 |
| 19534.2 | 14.295 |
| 19543.9 | 14.293 |
| 19553.5 | 14.291 |
| 19563.2 | 14.29 |
| 19572.9 | 14.291 |
| 19582.5 | 14.294 |
| 19592.2 | 14.297 |
| 19601.8 | 14.3 |
| 19611.5 | 14.304 |
| 19621.2 | 14.307 |
| 19630.8 | 14.31 |
| 19640.5 | 14.313 |
| 19650.1 | 14.318 |
| 19659.8 | 14.323 |
| 19669.5 | 14.329 |
| 19679.1 | 14.334 |
| 19688.8 | 14.339 |
| 19698.5 | 14.344 |
| 19708.1 | 14.349 |
| 19717.8 | 14.354 |
| 19727.4 | 14.358 |
| 19737.1 | 14.361 |
| 19746.8 | 14.365 |
| 19756.4 | 14.368 |
| 19766.1 | 14.372 |
| 19775.7 | 14.375 |
| 19785.4 | 14.379 |
| 19795.1 | 14.382 |
| 19804.7 | 14.383 |
| 19814.4 | 14.385 |
| 19824.0 | 14.387 |
| 19833.7 | 14.389 |
| 19843.4 | 14.391 |
| 19853.0 | 14.392 |
| 19862.7 | 14.394 |
| 19872.3 | 14.396 |
| 19882.0 | 14.398 |
| 19891.7 | 14.399 |
| 19901.3 | 14.401 |
| 19911.0 | 14.403 |
| 19920.7 | 14.405 |
| 19930.3 | 14.407 |
| 19940.0 | 14.408 |
| 19949.6 | 14.41 |
| 19959.3 | 14.41 |
| 19969.0 | 14.411 |
| 19978.6 | 14.412 |
| 19988.3 | 14.413 |
| 19997.9 | 14.414 |
| 20007.6 | 14.414 |
| 20017.3 | 14.415 |
| 20026.9 | 14.415 |
| 20036.6 | 14.413 |
| 20046.2 | 14.412 |
| 20055.9 | 14.411 |
| 20065.6 | 14.409 |
| 20075.2 | 14.408 |
| 20084.9 | 14.407 |
| 20094.5 | 14.405 |
| 20104.2 | 14.404 |
| 20113.9 | 14.404 |
| 20123.5 | 14.404 |
| 20133.2 | 14.403 |
| 20142.9 | 14.403 |
| 20152.5 | 14.402 |
| 20162.2 | 14.402 |
| 20171.8 | 14.402 |
| 20181.5 | 14.403 |
| 20191.2 | 14.407 |
| 20200.8 | 14.411 |
| 20210.5 | 14.415 |
| 20220.1 | 14.419 |
| 20229.8 | 14.422 |
| 20239.5 | 14.426 |
| 20249.1 | 14.43 |
| 20258.8 | 14.434 |
| 20268.4 | 14.439 |
| 20278.1 | 14.444 |
| 20287.8 | 14.449 |
| 20297.4 | 14.453 |
| 20307.1 | 14.458 |
| 20316.7 | 14.463 |
| 20326.4 | 14.468 |
| 20336.1 | 14.472 |
| 20345.7 | 14.473 |
| 20355.4 | 14.474 |
| 20365.0 | 14.475 |
| 20374.7 | 14.476 |
| 20384.4 | 14.477 |
| 20394.0 | 14.478 |
| 20403.7 | 14.478 |
| 20413.4 | 14.479 |
| 20423.0 | 14.479 |
| 20432.7 | 14.477 |
| 20442.3 | 14.476 |
| 20452.0 | 14.475 |
| 20461.7 | 14.474 |
| 20471.3 | 14.473 |
| 20481.0 | 14.471 |
| 20490.6 | 14.47 |
| 20500.3 | 14.47 |
| 20510.0 | 14.472 |
| 20519.6 | 14.473 |
| 20529.3 | 14.474 |
| 20538.9 | 14.476 |
| 20548.6 | 14.477 |
| 20558.3 | 14.479 |
| 20567.9 | 14.48 |
| 20577.6 | 14.482 |
| 20587.2 | 14.485 |
| 20596.9 | 14.489 |
| 20606.6 | 14.493 |
| 20616.2 | 14.496 |
| 20625.9 | 14.5 |
| 20635.6 | 14.503 |
| 20645.2 | 14.507 |
| 20654.9 | 14.511 |
| 20664.5 | 14.513 |
| 20674.2 | 14.515 |
| 20683.9 | 14.517 |
| 20693.5 | 14.519 |
| 20703.2 | 14.521 |
| 20712.8 | 14.523 |
| 20722.5 | 14.525 |
| 20732.2 | 14.527 |
| 20741.8 | 14.529 |
| 20751.5 | 14.529 |
| 20761.1 | 14.529 |
| 20770.8 | 14.53 |
| 20780.5 | 14.53 |
| 20790.1 | 14.53 |
| 20799.8 | 14.53 |
| 20809.4 | 14.53 |
| 20819.1 | 14.53 |
| 20828.8 | 14.531 |
| 20838.4 | 14.532 |
| 20848.1 | 14.534 |
| 20857.8 | 14.535 |
| 20867.4 | 14.537 |
| 20877.1 | 14.538 |
| 20886.7 | 14.539 |
| 20896.4 | 14.541 |
| 20906.1 | 14.542 |
| 20915.7 | 14.545 |
| 20925.4 | 14.549 |
| 20935.0 | 14.553 |
| 20944.7 | 14.557 |
| 20954.4 | 14.561 |
| 20964.0 | 14.565 |
| 20973.7 | 14.569 |
| 20983.3 | 14.573 |
| 20993.0 | 14.577 |
| 21002.7 | 14.581 |
| 21012.3 | 14.585 |
| 21022.0 | 14.589 |
| 21031.6 | 14.592 |
| 21041.3 | 14.596 |
| 21051.0 | 14.6 |
| 21060.6 | 14.604 |
| 21070.3 | 14.608 |
| 21080.0 | 14.612 |
| 21089.6 | 14.613 |
| 21099.3 | 14.615 |
| 21108.9 | 14.617 |
| 21118.6 | 14.619 |
| 21128.3 | 14.62 |
| 21137.9 | 14.622 |
| 21147.6 | 14.624 |
| 21157.2 | 14.625 |
| 21166.9 | 14.627 |
| 21176.6 | 14.628 |
| 21186.2 | 14.629 |
| 21195.9 | 14.63 |
| 21205.5 | 14.631 |
| 21215.2 | 14.632 |
| 21224.9 | 14.633 |
| 21234.5 | 14.634 |
| 21244.2 | 14.635 |
| 21253.8 | 14.637 |
| 21263.5 | 14.641 |
| 21273.2 | 14.645 |
| 21282.8 | 14.649 |
| 21292.5 | 14.654 |
| 21302.2 | 14.658 |
| 21311.8 | 14.662 |
| 21321.5 | 14.666 |
| 21331.1 | 14.67 |
| 21340.8 | 14.675 |
| 21350.5 | 14.683 |
| 21360.1 | 14.691 |
| 21369.8 | 14.699 |
| 21379.4 | 14.708 |
| 21389.1 | 14.716 |
| 21398.8 | 14.724 |
| 21408.4 | 14.732 |
| 21418.1 | 14.74 |
| 21427.7 | 14.748 |
| 21437.4 | 14.756 |
| 21447.1 | 14.763 |
| 21456.7 | 14.771 |
| 21466.4 | 14.778 |
| 21476.0 | 14.786 |
| 21485.7 | 14.793 |
| 21495.4 | 14.801 |
| 21505.0 | 14.808 |
| 21514.7 | 14.816 |
| 21524.4 | 14.82 |
| 21534.0 | 14.822 |
| 21543.7 | 14.825 |
| 21553.3 | 14.828 |
| 21563.0 | 14.831 |
| 21572.7 | 14.834 |
| 21582.3 | 14.837 |
| 21592.0 | 14.84 |
| 21601.6 | 14.843 |
| 21611.3 | 14.844 |
| 21621.0 | 14.843 |
| 21630.6 | 14.843 |
| 21640.3 | 14.843 |
| 21649.9 | 14.842 |
| 21659.6 | 14.842 |
| 21669.3 | 14.841 |
| 21678.9 | 14.841 |
| 21688.6 | 14.841 |
| 21698.2 | 14.841 |
| 21707.9 | 14.841 |
| 21717.6 | 14.842 |
| 21727.2 | 14.842 |
| 21736.9 | 14.843 |
| 21746.5 | 14.843 |
| 21756.2 | 14.844 |
| 21765.9 | 14.844 |
| 21775.5 | 14.845 |
| 21785.2 | 14.845 |
| 21794.9 | 14.848 |
| 21804.5 | 14.852 |
| 21814.2 | 14.856 |
| 21823.8 | 14.86 |
| 21833.5 | 14.863 |
| 21843.2 | 14.867 |
| 21852.8 | 14.871 |
| 21862.5 | 14.875 |
| 21872.1 | 14.879 |
| 21881.8 | 14.883 |
| 21891.5 | 14.888 |
| 21901.1 | 14.894 |
| 21910.8 | 14.9 |
| 21920.4 | 14.905 |
| 21930.1 | 14.911 |
| 21939.8 | 14.916 |
| 21949.4 | 14.922 |
| 21959.1 | 14.927 |
| 21968.7 | 14.933 |
| 21978.4 | 14.939 |
| 21988.1 | 14.945 |
| 21997.7 | 14.95 |
| 22007.4 | 14.956 |
| 22017.1 | 14.962 |
| 22026.7 | 14.967 |
| 22036.4 | 14.973 |
| 22046.0 | 14.979 |
| 22055.7 | 14.985 |
| 22065.4 | 14.99 |
| 22075.0 | 14.996 |
| 22084.7 | 15.002 |
| 22094.3 | 15.009 |
| 22104.0 | 15.015 |
| 22113.7 | 15.021 |
| 22123.3 | 15.027 |
| 22133.0 | 15.033 |
| 22142.6 | 15.039 |
| 22152.3 | 15.045 |
| 22162.0 | 15.051 |
| 22171.6 | 15.057 |
| 22181.3 | 15.063 |
| 22190.9 | 15.069 |
| 22200.6 | 15.075 |
| 22210.3 | 15.081 |
| 22219.9 | 15.087 |
| 22229.6 | 15.093 |
| 22239.3 | 15.099 |
| 22248.9 | 15.105 |
| 22258.6 | 15.111 |
| 22268.2 | 15.115 |
| 22277.9 | 15.119 |
| 22287.6 | 15.123 |
| 22297.2 | 15.127 |
| 22306.9 | 15.131 |
| 22316.5 | 15.135 |
| 22326.2 | 15.139 |
| 22335.9 | 15.143 |
| 22345.5 | 15.147 |
| 22355.2 | 15.15 |
| 22364.8 | 15.151 |
| 22374.5 | 15.152 |
| 22384.2 | 15.152 |
| 22393.8 | 15.153 |
| 22403.5 | 15.154 |
| 22413.1 | 15.155 |
| 22422.8 | 15.156 |
| 22432.5 | 15.157 |
| 22442.1 | 15.158 |
| 22451.8 | 15.159 |
| 22461.5 | 15.159 |
| 22471.1 | 15.159 |
| 22480.8 | 15.159 |
| 22490.4 | 15.16 |
| 22500.1 | 15.16 |
| 22509.8 | 15.16 |
| 22519.4 | 15.16 |
| 22529.1 | 15.161 |
| 22538.7 | 15.161 |
| 22548.4 | 15.162 |
| 22558.1 | 15.166 |
| 22567.7 | 15.169 |
| 22577.4 | 15.173 |
| 22587.0 | 15.177 |
| 22596.7 | 15.18 |
| 22606.4 | 15.184 |
| 22616.0 | 15.188 |
| 22625.7 | 15.192 |
| 22635.3 | 15.195 |
| 22645.0 | 15.199 |
| 22654.7 | 15.205 |
| 22664.3 | 15.211 |
| 22674.0 | 15.217 |
| 22683.7 | 15.223 |
| 22693.3 | 15.229 |
| 22703.0 | 15.234 |
| 22712.6 | 15.24 |
| 22722.3 | 15.246 |
| 22732.0 | 15.252 |
| 22741.6 | 15.258 |
| 22751.3 | 15.262 |
| 22760.9 | 15.265 |
| 22770.6 | 15.269 |
| 22780.3 | 15.272 |
| 22789.9 | 15.276 |
| 22799.6 | 15.279 |
| 22809.2 | 15.283 |
| 22818.9 | 15.286 |
| 22828.6 | 15.29 |
| 22838.2 | 15.293 |
| 22847.9 | 15.295 |
| 22857.5 | 15.295 |
| 22867.2 | 15.296 |
| 22876.9 | 15.296 |
| 22886.5 | 15.296 |
| 22896.2 | 15.296 |
| 22905.9 | 15.297 |
| 22915.5 | 15.297 |
| 22925.2 | 15.297 |
| 22934.8 | 15.297 |
| 22944.5 | 15.298 |
| 22954.2 | 15.297 |
| 22963.8 | 15.295 |
| 22973.5 | 15.294 |
| 22983.1 | 15.293 |
| 22992.8 | 15.292 |
| 23002.5 | 15.291 |
| 23012.1 | 15.29 |
| 23021.8 | 15.289 |
| 23031.4 | 15.288 |
| 23041.1 | 15.287 |
| 23050.8 | 15.285 |
| 23060.4 | 15.284 |
| 23070.1 | 15.282 |
| 23079.7 | 15.281 |
| 23089.4 | 15.28 |
| 23099.1 | 15.278 |
| 23108.7 | 15.277 |
| 23118.4 | 15.275 |
| 23128.0 | 15.274 |
| 23137.7 | 15.272 |
| 23147.4 | 15.271 |
| 23157.0 | 15.269 |
| 23166.7 | 15.267 |
| 23176.4 | 15.265 |
| 23186.0 | 15.263 |
| 23195.7 | 15.26 |
| 23205.3 | 15.258 |
| 23215.0 | 15.256 |
| 23224.7 | 15.254 |
| 23234.3 | 15.252 |
| 23244.0 | 15.25 |
| 23253.6 | 15.248 |
| 23263.3 | 15.243 |
| 23273.0 | 15.238 |
| 23282.6 | 15.233 |
| 23292.3 | 15.229 |
| 23301.9 | 15.224 |
| 23311.6 | 15.219 |
| 23321.3 | 15.214 |
| 23330.9 | 15.21 |
| 23340.6 | 15.205 |
| 23350.2 | 15.2 |
| 23359.9 | 15.195 |
| 23369.6 | 15.189 |
| 23379.2 | 15.182 |
| 23388.9 | 15.176 |
| 23398.6 | 15.169 |
| 23408.2 | 15.163 |
| 23417.9 | 15.156 |
| 23427.5 | 15.15 |
| 23437.2 | 15.144 |
| 23446.9 | 15.137 |
| 23456.5 | 15.131 |
| 23466.2 | 15.125 |
| 23475.8 | 15.119 |
| 23485.5 | 15.114 |
| 23495.2 | 15.109 |
| 23504.8 | 15.103 |
| 23514.5 | 15.098 |
| 23524.1 | 15.092 |
| 23533.8 | 15.087 |
| 23543.5 | 15.082 |
| 23553.1 | 15.076 |
| 23562.8 | 15.071 |
| 23572.4 | 15.066 |
| 23582.1 | 15.059 |
| 23591.8 | 15.053 |
| 23601.4 | 15.047 |
| 23611.1 | 15.041 |
| 23620.8 | 15.035 |
| 23630.4 | 15.028 |
| 23640.1 | 15.022 |
| 23649.7 | 15.016 |
| 23659.4 | 15.01 |
| 23669.1 | 15.004 |
| 23678.7 | 14.997 |
| 23688.4 | 14.989 |
| 23698.0 | 14.981 |
| 23707.7 | 14.972 |
| 23717.4 | 14.964 |
| 23727.0 | 14.955 |
| 23736.7 | 14.947 |
| 23746.3 | 14.939 |
| 23756.0 | 14.93 |
| 23765.7 | 14.922 |
| 23775.3 | 14.913 |
| 23785.0 | 14.905 |
| 23794.6 | 14.903 |
| 23804.3 | 14.902 |
| 23814.0 | 14.902 |
| 23823.6 | 14.901 |
| 23833.3 | 14.9 |
| 23843.0 | 14.9 |
| 23852.6 | 14.899 |
| 23862.3 | 14.898 |
| 23871.9 | 14.897 |
| 23881.6 | 14.897 |
| 23891.3 | 14.896 |
| 23900.9 | 14.902 |
| 23910.6 | 14.916 |
| 23920.2 | 14.929 |
| 23929.9 | 14.943 |
| 23939.6 | 14.957 |
| 23949.2 | 14.97 |
| 23958.9 | 14.984 |
| 23968.5 | 14.997 |
| 23978.2 | 15.01 |
| 23987.9 | 15.024 |
| 23997.5 | 15.037 |
| 24007.2 | 15.051 |
| 24016.8 | 15.069 |
| 24026.5 | 15.087 |
| 24036.2 | 15.105 |
| 24045.8 | 15.123 |
| 24055.5 | 15.142 |
| 24065.2 | 15.16 |
| 24074.8 | 15.178 |
| 24084.5 | 15.196 |
| 24094.1 | 15.214 |
| 24103.8 | 15.232 |
| 24113.5 | 15.25 |
| 24123.1 | 15.265 |
| 24132.8 | 15.278 |
| 24142.4 | 15.291 |
| 24152.1 | 15.303 |
| 24161.8 | 15.316 |
| 24171.4 | 15.329 |
| 24181.1 | 15.342 |
| 24190.7 | 15.354 |
| 24200.4 | 15.367 |
| 24210.1 | 15.38 |
| 24219.7 | 15.392 |
| 24229.4 | 15.405 |
| 24239.0 | 15.409 |
| 24248.7 | 15.412 |
| 24258.4 | 15.414 |
| 24268.0 | 15.416 |
| 24277.7 | 15.419 |
| 24287.4 | 15.421 |
| 24297.0 | 15.423 |
| 24306.7 | 15.426 |
| 24316.3 | 15.428 |
| 24326.0 | 15.43 |
| 24335.7 | 15.432 |
| 24345.3 | 15.434 |
| 24355.0 | 15.429 |
| 24364.6 | 15.423 |
| 24374.3 | 15.418 |
| 24384.0 | 15.412 |
| 24393.6 | 15.407 |
| 24403.3 | 15.401 |
| 24412.9 | 15.396 |
| 24422.6 | 15.39 |
| 24432.3 | 15.385 |
| 24441.9 | 15.379 |
| 24451.6 | 15.374 |
| 24461.2 | 15.369 |
| 24470.9 | 15.366 |
| 24480.6 | 15.363 |
| 24490.2 | 15.36 |
| 24499.9 | 15.358 |
| 24509.5 | 15.355 |
| 24519.2 | 15.352 |
| 24528.9 | 15.349 |
| 24538.5 | 15.347 |
| 24548.2 | 15.344 |
| 24557.9 | 15.341 |
| 24567.5 | 15.338 |
| 24577.2 | 15.337 |
| 24586.8 | 15.345 |
| 24596.5 | 15.352 |
| 24606.2 | 15.36 |
| 24615.8 | 15.368 |
| 24625.5 | 15.375 |
| 24635.1 | 15.383 |
| 24644.8 | 15.39 |
| 24654.5 | 15.398 |
| 24664.1 | 15.406 |
| 24673.8 | 15.413 |
| 24683.4 | 15.421 |
| 24693.1 | 15.429 |
| 24702.8 | 15.442 |
| 24712.4 | 15.456 |
| 24722.1 | 15.469 |
| 24731.7 | 15.482 |
| 24741.4 | 15.496 |
| 24751.1 | 15.509 |
| 24760.7 | 15.523 |
| 24770.4 | 15.536 |
| 24780.1 | 15.55 |
| 24789.7 | 15.563 |
| 24799.4 | 15.576 |
| 24809.0 | 15.59 |
| 24818.7 | 15.596 |
| 24828.4 | 15.601 |
| 24838.0 | 15.606 |
| 24847.7 | 15.61 |
| 24857.3 | 15.615 |
| 24867.0 | 15.62 |
| 24876.7 | 15.625 |
| 24886.3 | 15.629 |
| 24896.0 | 15.634 |
| 24905.6 | 15.639 |
| 24915.3 | 15.644 |
| 24925.0 | 15.648 |
| 24934.6 | 15.646 |
| 24944.3 | 15.636 |
| 24953.9 | 15.626 |
| 24963.6 | 15.616 |
| 24973.3 | 15.606 |
| 24982.9 | 15.596 |
| 24992.6 | 15.586 |
| 25002.3 | 15.576 |